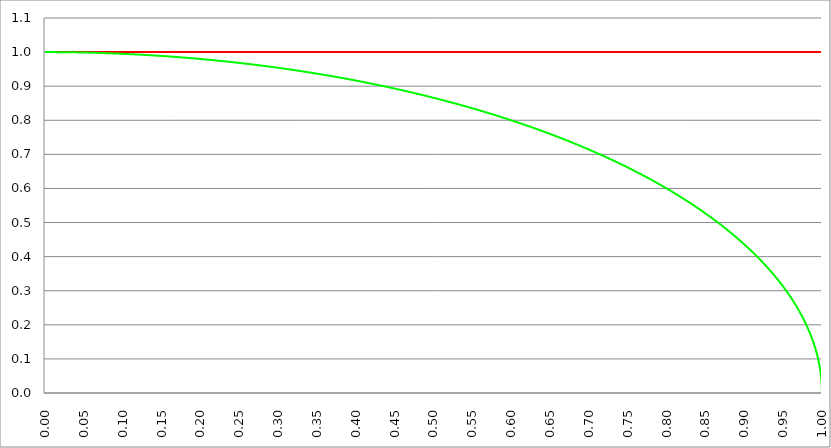
| Category | Series 1 | Series 0 | Series 2 |
|---|---|---|---|
| 0.0 | 1 | 1 |  |
| 0.0005 | 1 | 1 |  |
| 0.001 | 1 | 1 |  |
| 0.0015 | 1 | 1 |  |
| 0.002 | 1 | 1 |  |
| 0.0025 | 1 | 1 |  |
| 0.003 | 1 | 1 |  |
| 0.0035 | 1 | 1 |  |
| 0.004 | 1 | 1 |  |
| 0.0045 | 1 | 1 |  |
| 0.005 | 1 | 1 |  |
| 0.0055 | 1 | 1 |  |
| 0.006 | 1 | 1 |  |
| 0.0065 | 1 | 1 |  |
| 0.007 | 1 | 1 |  |
| 0.0075 | 1 | 1 |  |
| 0.008 | 1 | 1 |  |
| 0.0085 | 1 | 1 |  |
| 0.009 | 1 | 1 |  |
| 0.0095 | 1 | 1 |  |
| 0.01 | 1 | 1 |  |
| 0.0105 | 1 | 1 |  |
| 0.011 | 1 | 1 |  |
| 0.0115 | 1 | 1 |  |
| 0.012 | 1 | 1 |  |
| 0.0125 | 1 | 1 |  |
| 0.013 | 1 | 1 |  |
| 0.0135 | 1 | 1 |  |
| 0.014 | 1 | 1 |  |
| 0.0145 | 1 | 1 |  |
| 0.015 | 1 | 1 |  |
| 0.0155 | 1 | 1 |  |
| 0.016 | 1 | 1 |  |
| 0.0165 | 1 | 1 |  |
| 0.017 | 1 | 1 |  |
| 0.0175 | 1 | 1 |  |
| 0.018 | 1 | 1 |  |
| 0.0185 | 1 | 1 |  |
| 0.019 | 1 | 1 |  |
| 0.0195 | 1 | 1 |  |
| 0.02 | 1 | 1 |  |
| 0.0205 | 1 | 1 |  |
| 0.021 | 1 | 1 |  |
| 0.0215 | 1 | 1 |  |
| 0.022 | 1 | 1 |  |
| 0.0225 | 1 | 1 |  |
| 0.023 | 1 | 1 |  |
| 0.0235 | 1 | 1 |  |
| 0.024 | 1 | 1 |  |
| 0.0245 | 1 | 1 |  |
| 0.025 | 1 | 1 |  |
| 0.0255 | 1 | 1 |  |
| 0.026 | 1 | 1 |  |
| 0.0265 | 1 | 1 |  |
| 0.027 | 1 | 1 |  |
| 0.0275 | 1 | 1 |  |
| 0.028 | 1 | 1 |  |
| 0.0285 | 1 | 1 |  |
| 0.029 | 1 | 1 |  |
| 0.0295 | 1 | 1 |  |
| 0.03 | 1 | 1 |  |
| 0.0305 | 1 | 1 |  |
| 0.031 | 1 | 1 |  |
| 0.0315 | 1 | 1 |  |
| 0.032 | 1 | 0.999 |  |
| 0.0325 | 1 | 0.999 |  |
| 0.033 | 1 | 0.999 |  |
| 0.0335 | 1 | 0.999 |  |
| 0.034 | 1 | 0.999 |  |
| 0.0345 | 1 | 0.999 |  |
| 0.035 | 1 | 0.999 |  |
| 0.0355 | 1 | 0.999 |  |
| 0.036 | 1 | 0.999 |  |
| 0.0365 | 1 | 0.999 |  |
| 0.037 | 1 | 0.999 |  |
| 0.0375 | 1 | 0.999 |  |
| 0.038 | 1 | 0.999 |  |
| 0.0385 | 1 | 0.999 |  |
| 0.039 | 1 | 0.999 |  |
| 0.0395 | 1 | 0.999 |  |
| 0.04 | 1 | 0.999 |  |
| 0.0405 | 1 | 0.999 |  |
| 0.041 | 1 | 0.999 |  |
| 0.0415 | 1 | 0.999 |  |
| 0.042 | 1 | 0.999 |  |
| 0.0425 | 1 | 0.999 |  |
| 0.043 | 1 | 0.999 |  |
| 0.0435 | 1 | 0.999 |  |
| 0.044 | 1 | 0.999 |  |
| 0.0445 | 1 | 0.999 |  |
| 0.045 | 1 | 0.999 |  |
| 0.0455 | 1 | 0.999 |  |
| 0.046 | 1 | 0.999 |  |
| 0.0465 | 1 | 0.999 |  |
| 0.047 | 1 | 0.999 |  |
| 0.0475 | 1 | 0.999 |  |
| 0.048 | 1 | 0.999 |  |
| 0.0485 | 1 | 0.999 |  |
| 0.049 | 1 | 0.999 |  |
| 0.0495 | 1 | 0.999 |  |
| 0.05 | 1 | 0.999 |  |
| 0.0505 | 1 | 0.999 |  |
| 0.051 | 1 | 0.999 |  |
| 0.0515 | 1 | 0.999 |  |
| 0.052 | 1 | 0.999 |  |
| 0.0525 | 1 | 0.999 |  |
| 0.053 | 1 | 0.999 |  |
| 0.0535 | 1 | 0.999 |  |
| 0.054 | 1 | 0.999 |  |
| 0.0545 | 1 | 0.999 |  |
| 0.055 | 1 | 0.998 |  |
| 0.0555 | 1 | 0.998 |  |
| 0.056 | 1 | 0.998 |  |
| 0.0565 | 1 | 0.998 |  |
| 0.057 | 1 | 0.998 |  |
| 0.0575 | 1 | 0.998 |  |
| 0.058 | 1 | 0.998 |  |
| 0.0585 | 1 | 0.998 |  |
| 0.059 | 1 | 0.998 |  |
| 0.0595 | 1 | 0.998 |  |
| 0.06 | 1 | 0.998 |  |
| 0.0605 | 1 | 0.998 |  |
| 0.061 | 1 | 0.998 |  |
| 0.0615 | 1 | 0.998 |  |
| 0.062 | 1 | 0.998 |  |
| 0.0625 | 1 | 0.998 |  |
| 0.063 | 1 | 0.998 |  |
| 0.0635 | 1 | 0.998 |  |
| 0.064 | 1 | 0.998 |  |
| 0.0645 | 1 | 0.998 |  |
| 0.065 | 1 | 0.998 |  |
| 0.0655 | 1 | 0.998 |  |
| 0.066 | 1 | 0.998 |  |
| 0.0665 | 1 | 0.998 |  |
| 0.067 | 1 | 0.998 |  |
| 0.0675 | 1 | 0.998 |  |
| 0.068 | 1 | 0.998 |  |
| 0.0685 | 1 | 0.998 |  |
| 0.069 | 1 | 0.998 |  |
| 0.0695 | 1 | 0.998 |  |
| 0.07 | 1 | 0.998 |  |
| 0.0705 | 1 | 0.998 |  |
| 0.071 | 1 | 0.997 |  |
| 0.0715 | 1 | 0.997 |  |
| 0.072 | 1 | 0.997 |  |
| 0.0725 | 1 | 0.997 |  |
| 0.073 | 1 | 0.997 |  |
| 0.0735 | 1 | 0.997 |  |
| 0.074 | 1 | 0.997 |  |
| 0.0745 | 1 | 0.997 |  |
| 0.075 | 1 | 0.997 |  |
| 0.0755 | 1 | 0.997 |  |
| 0.076 | 1 | 0.997 |  |
| 0.0765 | 1 | 0.997 |  |
| 0.077 | 1 | 0.997 |  |
| 0.0775 | 1 | 0.997 |  |
| 0.078 | 1 | 0.997 |  |
| 0.0785 | 1 | 0.997 |  |
| 0.079 | 1 | 0.997 |  |
| 0.0795 | 1 | 0.997 |  |
| 0.08 | 1 | 0.997 |  |
| 0.0805 | 1 | 0.997 |  |
| 0.081 | 1 | 0.997 |  |
| 0.0815 | 1 | 0.997 |  |
| 0.082 | 1 | 0.997 |  |
| 0.0825 | 1 | 0.997 |  |
| 0.083 | 1 | 0.997 |  |
| 0.0835 | 1 | 0.997 |  |
| 0.084 | 1 | 0.996 |  |
| 0.0845 | 1 | 0.996 |  |
| 0.085 | 1 | 0.996 |  |
| 0.0855 | 1 | 0.996 |  |
| 0.086 | 1 | 0.996 |  |
| 0.0865 | 1 | 0.996 |  |
| 0.087 | 1 | 0.996 |  |
| 0.0875 | 1 | 0.996 |  |
| 0.088 | 1 | 0.996 |  |
| 0.0885 | 1 | 0.996 |  |
| 0.089 | 1 | 0.996 |  |
| 0.0895 | 1 | 0.996 |  |
| 0.09 | 1 | 0.996 |  |
| 0.0905 | 1 | 0.996 |  |
| 0.091 | 1 | 0.996 |  |
| 0.0915 | 1 | 0.996 |  |
| 0.092 | 1 | 0.996 |  |
| 0.0925 | 1 | 0.996 |  |
| 0.093 | 1 | 0.996 |  |
| 0.0935 | 1 | 0.996 |  |
| 0.094 | 1 | 0.996 |  |
| 0.0945 | 1 | 0.996 |  |
| 0.095 | 1 | 0.995 |  |
| 0.0955 | 1 | 0.995 |  |
| 0.096 | 1 | 0.995 |  |
| 0.0965 | 1 | 0.995 |  |
| 0.097 | 1 | 0.995 |  |
| 0.0975 | 1 | 0.995 |  |
| 0.098 | 1 | 0.995 |  |
| 0.0985 | 1 | 0.995 |  |
| 0.099 | 1 | 0.995 |  |
| 0.0995 | 1 | 0.995 |  |
| 0.1 | 1 | 0.995 |  |
| 0.1005 | 1 | 0.995 |  |
| 0.101 | 1 | 0.995 |  |
| 0.1015 | 1 | 0.995 |  |
| 0.102 | 1 | 0.995 |  |
| 0.1025 | 1 | 0.995 |  |
| 0.103 | 1 | 0.995 |  |
| 0.1035 | 1 | 0.995 |  |
| 0.104 | 1 | 0.995 |  |
| 0.1045 | 1 | 0.995 |  |
| 0.105 | 1 | 0.994 |  |
| 0.1055 | 1 | 0.994 |  |
| 0.106 | 1 | 0.994 |  |
| 0.1065 | 1 | 0.994 |  |
| 0.107 | 1 | 0.994 |  |
| 0.1075 | 1 | 0.994 |  |
| 0.108 | 1 | 0.994 |  |
| 0.1085 | 1 | 0.994 |  |
| 0.109 | 1 | 0.994 |  |
| 0.1095 | 1 | 0.994 |  |
| 0.11 | 1 | 0.994 |  |
| 0.1105 | 1 | 0.994 |  |
| 0.111 | 1 | 0.994 |  |
| 0.1115 | 1 | 0.994 |  |
| 0.112 | 1 | 0.994 |  |
| 0.1125 | 1 | 0.994 |  |
| 0.113 | 1 | 0.994 |  |
| 0.1135 | 1 | 0.994 |  |
| 0.114 | 1 | 0.993 |  |
| 0.1145 | 1 | 0.993 |  |
| 0.115 | 1 | 0.993 |  |
| 0.1155 | 1 | 0.993 |  |
| 0.116 | 1 | 0.993 |  |
| 0.1165 | 1 | 0.993 |  |
| 0.117 | 1 | 0.993 |  |
| 0.1175 | 1 | 0.993 |  |
| 0.118 | 1 | 0.993 |  |
| 0.1185 | 1 | 0.993 |  |
| 0.119 | 1 | 0.993 |  |
| 0.1195 | 1 | 0.993 |  |
| 0.12 | 1 | 0.993 |  |
| 0.1205 | 1 | 0.993 |  |
| 0.121 | 1 | 0.993 |  |
| 0.1215 | 1 | 0.993 |  |
| 0.122 | 1 | 0.993 |  |
| 0.1225 | 1 | 0.992 |  |
| 0.123 | 1 | 0.992 |  |
| 0.1235 | 1 | 0.992 |  |
| 0.124 | 1 | 0.992 |  |
| 0.1245 | 1 | 0.992 |  |
| 0.125 | 1 | 0.992 |  |
| 0.1255 | 1 | 0.992 |  |
| 0.126 | 1 | 0.992 |  |
| 0.1265 | 1 | 0.992 |  |
| 0.127 | 1 | 0.992 |  |
| 0.1275 | 1 | 0.992 |  |
| 0.128 | 1 | 0.992 |  |
| 0.1285 | 1 | 0.992 |  |
| 0.129 | 1 | 0.992 |  |
| 0.1295 | 1 | 0.992 |  |
| 0.13 | 1 | 0.992 |  |
| 0.1305 | 1 | 0.991 |  |
| 0.131 | 1 | 0.991 |  |
| 0.1315 | 1 | 0.991 |  |
| 0.132 | 1 | 0.991 |  |
| 0.1325 | 1 | 0.991 |  |
| 0.133 | 1 | 0.991 |  |
| 0.1335 | 1 | 0.991 |  |
| 0.134 | 1 | 0.991 |  |
| 0.1345 | 1 | 0.991 |  |
| 0.135 | 1 | 0.991 |  |
| 0.1355 | 1 | 0.991 |  |
| 0.136 | 1 | 0.991 |  |
| 0.1365 | 1 | 0.991 |  |
| 0.137 | 1 | 0.991 |  |
| 0.1375 | 1 | 0.991 |  |
| 0.138 | 1 | 0.99 |  |
| 0.1385 | 1 | 0.99 |  |
| 0.139 | 1 | 0.99 |  |
| 0.1395 | 1 | 0.99 |  |
| 0.14 | 1 | 0.99 |  |
| 0.1405 | 1 | 0.99 |  |
| 0.141 | 1 | 0.99 |  |
| 0.1415 | 1 | 0.99 |  |
| 0.142 | 1 | 0.99 |  |
| 0.1425 | 1 | 0.99 |  |
| 0.143 | 1 | 0.99 |  |
| 0.1435 | 1 | 0.99 |  |
| 0.144 | 1 | 0.99 |  |
| 0.1445 | 1 | 0.99 |  |
| 0.145 | 1 | 0.989 |  |
| 0.1455 | 1 | 0.989 |  |
| 0.146 | 1 | 0.989 |  |
| 0.1465 | 1 | 0.989 |  |
| 0.147 | 1 | 0.989 |  |
| 0.1475 | 1 | 0.989 |  |
| 0.148 | 1 | 0.989 |  |
| 0.1485 | 1 | 0.989 |  |
| 0.149 | 1 | 0.989 |  |
| 0.1495 | 1 | 0.989 |  |
| 0.15 | 1 | 0.989 |  |
| 0.1505 | 1 | 0.989 |  |
| 0.151 | 1 | 0.989 |  |
| 0.1515 | 1 | 0.988 |  |
| 0.152 | 1 | 0.988 |  |
| 0.1525 | 1 | 0.988 |  |
| 0.153 | 1 | 0.988 |  |
| 0.1535 | 1 | 0.988 |  |
| 0.154 | 1 | 0.988 |  |
| 0.1545 | 1 | 0.988 |  |
| 0.155 | 1 | 0.988 |  |
| 0.1555 | 1 | 0.988 |  |
| 0.156 | 1 | 0.988 |  |
| 0.1565 | 1 | 0.988 |  |
| 0.157 | 1 | 0.988 |  |
| 0.1575 | 1 | 0.988 |  |
| 0.158 | 1 | 0.987 |  |
| 0.1585 | 1 | 0.987 |  |
| 0.159 | 1 | 0.987 |  |
| 0.1595 | 1 | 0.987 |  |
| 0.16 | 1 | 0.987 |  |
| 0.1605 | 1 | 0.987 |  |
| 0.161 | 1 | 0.987 |  |
| 0.1615 | 1 | 0.987 |  |
| 0.162 | 1 | 0.987 |  |
| 0.1625 | 1 | 0.987 |  |
| 0.163 | 1 | 0.987 |  |
| 0.1635 | 1 | 0.987 |  |
| 0.164 | 1 | 0.986 |  |
| 0.1645 | 1 | 0.986 |  |
| 0.165 | 1 | 0.986 |  |
| 0.1655 | 1 | 0.986 |  |
| 0.166 | 1 | 0.986 |  |
| 0.1665 | 1 | 0.986 |  |
| 0.167 | 1 | 0.986 |  |
| 0.1675 | 1 | 0.986 |  |
| 0.168 | 1 | 0.986 |  |
| 0.1685 | 1 | 0.986 |  |
| 0.169 | 1 | 0.986 |  |
| 0.1695 | 1 | 0.986 |  |
| 0.17 | 1 | 0.985 |  |
| 0.1705 | 1 | 0.985 |  |
| 0.171 | 1 | 0.985 |  |
| 0.1715 | 1 | 0.985 |  |
| 0.172 | 1 | 0.985 |  |
| 0.1725 | 1 | 0.985 |  |
| 0.173 | 1 | 0.985 |  |
| 0.1735 | 1 | 0.985 |  |
| 0.174 | 1 | 0.985 |  |
| 0.1745 | 1 | 0.985 |  |
| 0.175 | 1 | 0.985 |  |
| 0.1755 | 1 | 0.984 |  |
| 0.176 | 1 | 0.984 |  |
| 0.1765 | 1 | 0.984 |  |
| 0.177 | 1 | 0.984 |  |
| 0.1775 | 1 | 0.984 |  |
| 0.178 | 1 | 0.984 |  |
| 0.1785 | 1 | 0.984 |  |
| 0.179 | 1 | 0.984 |  |
| 0.1795 | 1 | 0.984 |  |
| 0.18 | 1 | 0.984 |  |
| 0.1805 | 1 | 0.984 |  |
| 0.181 | 1 | 0.983 |  |
| 0.1815 | 1 | 0.983 |  |
| 0.182 | 1 | 0.983 |  |
| 0.1825 | 1 | 0.983 |  |
| 0.183 | 1 | 0.983 |  |
| 0.1835 | 1 | 0.983 |  |
| 0.184 | 1 | 0.983 |  |
| 0.1845 | 1 | 0.983 |  |
| 0.185 | 1 | 0.983 |  |
| 0.1855 | 1 | 0.983 |  |
| 0.186 | 1 | 0.983 |  |
| 0.1865 | 1 | 0.982 |  |
| 0.187 | 1 | 0.982 |  |
| 0.1875 | 1 | 0.982 |  |
| 0.188 | 1 | 0.982 |  |
| 0.1885 | 1 | 0.982 |  |
| 0.189 | 1 | 0.982 |  |
| 0.1895 | 1 | 0.982 |  |
| 0.19 | 1 | 0.982 |  |
| 0.1905 | 1 | 0.982 |  |
| 0.191 | 1 | 0.982 |  |
| 0.1915 | 1 | 0.981 |  |
| 0.192 | 1 | 0.981 |  |
| 0.1925 | 1 | 0.981 |  |
| 0.193 | 1 | 0.981 |  |
| 0.1935 | 1 | 0.981 |  |
| 0.194 | 1 | 0.981 |  |
| 0.1945 | 1 | 0.981 |  |
| 0.195 | 1 | 0.981 |  |
| 0.1955 | 1 | 0.981 |  |
| 0.196 | 1 | 0.981 |  |
| 0.1965 | 1 | 0.981 |  |
| 0.197 | 1 | 0.98 |  |
| 0.1975 | 1 | 0.98 |  |
| 0.198 | 1 | 0.98 |  |
| 0.1985 | 1 | 0.98 |  |
| 0.199 | 1 | 0.98 |  |
| 0.1995 | 1 | 0.98 |  |
| 0.2 | 1 | 0.98 |  |
| 0.2005 | 1 | 0.98 |  |
| 0.201 | 1 | 0.98 |  |
| 0.2015 | 1 | 0.979 |  |
| 0.202 | 1 | 0.979 |  |
| 0.2025 | 1 | 0.979 |  |
| 0.203 | 1 | 0.979 |  |
| 0.2035 | 1 | 0.979 |  |
| 0.204 | 1 | 0.979 |  |
| 0.2045 | 1 | 0.979 |  |
| 0.205 | 1 | 0.979 |  |
| 0.2055 | 1 | 0.979 |  |
| 0.206 | 1 | 0.979 |  |
| 0.2065 | 1 | 0.978 |  |
| 0.207 | 1 | 0.978 |  |
| 0.2075 | 1 | 0.978 |  |
| 0.208 | 1 | 0.978 |  |
| 0.2085 | 1 | 0.978 |  |
| 0.209 | 1 | 0.978 |  |
| 0.2095 | 1 | 0.978 |  |
| 0.21 | 1 | 0.978 |  |
| 0.2105 | 1 | 0.978 |  |
| 0.211 | 1 | 0.977 |  |
| 0.2115 | 1 | 0.977 |  |
| 0.212 | 1 | 0.977 |  |
| 0.2125 | 1 | 0.977 |  |
| 0.213 | 1 | 0.977 |  |
| 0.2135 | 1 | 0.977 |  |
| 0.214 | 1 | 0.977 |  |
| 0.2145 | 1 | 0.977 |  |
| 0.215 | 1 | 0.977 |  |
| 0.2155 | 1 | 0.977 |  |
| 0.216 | 1 | 0.976 |  |
| 0.2165 | 1 | 0.976 |  |
| 0.217 | 1 | 0.976 |  |
| 0.2175 | 1 | 0.976 |  |
| 0.218 | 1 | 0.976 |  |
| 0.2185 | 1 | 0.976 |  |
| 0.219 | 1 | 0.976 |  |
| 0.2195 | 1 | 0.976 |  |
| 0.22 | 1 | 0.975 |  |
| 0.2205 | 1 | 0.975 |  |
| 0.221 | 1 | 0.975 |  |
| 0.2215 | 1 | 0.975 |  |
| 0.222 | 1 | 0.975 |  |
| 0.2225 | 1 | 0.975 |  |
| 0.223 | 1 | 0.975 |  |
| 0.2235 | 1 | 0.975 |  |
| 0.224 | 1 | 0.975 |  |
| 0.2245 | 1 | 0.974 |  |
| 0.225 | 1 | 0.974 |  |
| 0.2255 | 1 | 0.974 |  |
| 0.226 | 1 | 0.974 |  |
| 0.2265 | 1 | 0.974 |  |
| 0.227 | 1 | 0.974 |  |
| 0.2275 | 1 | 0.974 |  |
| 0.228 | 1 | 0.974 |  |
| 0.2285 | 1 | 0.974 |  |
| 0.229 | 1 | 0.973 |  |
| 0.2295 | 1 | 0.973 |  |
| 0.23 | 1 | 0.973 |  |
| 0.2305 | 1 | 0.973 |  |
| 0.231 | 1 | 0.973 |  |
| 0.2315 | 1 | 0.973 |  |
| 0.232 | 1 | 0.973 |  |
| 0.2325 | 1 | 0.973 |  |
| 0.233 | 1 | 0.972 |  |
| 0.2335 | 1 | 0.972 |  |
| 0.234 | 1 | 0.972 |  |
| 0.2345 | 1 | 0.972 |  |
| 0.235 | 1 | 0.972 |  |
| 0.2355 | 1 | 0.972 |  |
| 0.236 | 1 | 0.972 |  |
| 0.2365 | 1 | 0.972 |  |
| 0.237 | 1 | 0.972 |  |
| 0.2375 | 1 | 0.971 |  |
| 0.238 | 1 | 0.971 |  |
| 0.2385 | 1 | 0.971 |  |
| 0.239 | 1 | 0.971 |  |
| 0.2395 | 1 | 0.971 |  |
| 0.24 | 1 | 0.971 |  |
| 0.2405 | 1 | 0.971 |  |
| 0.241 | 1 | 0.971 |  |
| 0.2415 | 1 | 0.97 |  |
| 0.242 | 1 | 0.97 |  |
| 0.2425 | 1 | 0.97 |  |
| 0.243 | 1 | 0.97 |  |
| 0.2435 | 1 | 0.97 |  |
| 0.244 | 1 | 0.97 |  |
| 0.2445 | 1 | 0.97 |  |
| 0.245 | 1 | 0.97 |  |
| 0.2455 | 1 | 0.969 |  |
| 0.246 | 1 | 0.969 |  |
| 0.2465 | 1 | 0.969 |  |
| 0.247 | 1 | 0.969 |  |
| 0.2475 | 1 | 0.969 |  |
| 0.248 | 1 | 0.969 |  |
| 0.2485 | 1 | 0.969 |  |
| 0.249 | 1 | 0.969 |  |
| 0.2495 | 1 | 0.968 |  |
| 0.25 | 1 | 0.968 |  |
| 0.2505 | 1 | 0.968 |  |
| 0.251 | 1 | 0.968 |  |
| 0.2515 | 1 | 0.968 |  |
| 0.252 | 1 | 0.968 |  |
| 0.2525 | 1 | 0.968 |  |
| 0.253 | 1 | 0.967 |  |
| 0.2535 | 1 | 0.967 |  |
| 0.254 | 1 | 0.967 |  |
| 0.2545 | 1 | 0.967 |  |
| 0.255 | 1 | 0.967 |  |
| 0.2555 | 1 | 0.967 |  |
| 0.256 | 1 | 0.967 |  |
| 0.2565 | 1 | 0.967 |  |
| 0.257 | 1 | 0.966 |  |
| 0.2575 | 1 | 0.966 |  |
| 0.258 | 1 | 0.966 |  |
| 0.2585 | 1 | 0.966 |  |
| 0.259 | 1 | 0.966 |  |
| 0.2595 | 1 | 0.966 |  |
| 0.26 | 1 | 0.966 |  |
| 0.2605 | 1 | 0.965 |  |
| 0.261 | 1 | 0.965 |  |
| 0.2615 | 1 | 0.965 |  |
| 0.262 | 1 | 0.965 |  |
| 0.2625 | 1 | 0.965 |  |
| 0.263 | 1 | 0.965 |  |
| 0.2635 | 1 | 0.965 |  |
| 0.264 | 1 | 0.965 |  |
| 0.2645 | 1 | 0.964 |  |
| 0.265 | 1 | 0.964 |  |
| 0.2655 | 1 | 0.964 |  |
| 0.266 | 1 | 0.964 |  |
| 0.2665 | 1 | 0.964 |  |
| 0.267 | 1 | 0.964 |  |
| 0.2675 | 1 | 0.964 |  |
| 0.268 | 1 | 0.963 |  |
| 0.2685 | 1 | 0.963 |  |
| 0.269 | 1 | 0.963 |  |
| 0.2695 | 1 | 0.963 |  |
| 0.27 | 1 | 0.963 |  |
| 0.2705 | 1 | 0.963 |  |
| 0.271 | 1 | 0.963 |  |
| 0.2715 | 1 | 0.962 |  |
| 0.272 | 1 | 0.962 |  |
| 0.2725 | 1 | 0.962 |  |
| 0.273 | 1 | 0.962 |  |
| 0.2735 | 1 | 0.962 |  |
| 0.274 | 1 | 0.962 |  |
| 0.2745 | 1 | 0.962 |  |
| 0.275 | 1 | 0.961 |  |
| 0.2755 | 1 | 0.961 |  |
| 0.276 | 1 | 0.961 |  |
| 0.2765 | 1 | 0.961 |  |
| 0.277 | 1 | 0.961 |  |
| 0.2775 | 1 | 0.961 |  |
| 0.278 | 1 | 0.961 |  |
| 0.2785 | 1 | 0.96 |  |
| 0.279 | 1 | 0.96 |  |
| 0.2795 | 1 | 0.96 |  |
| 0.28 | 1 | 0.96 |  |
| 0.2805 | 1 | 0.96 |  |
| 0.281 | 1 | 0.96 |  |
| 0.2815 | 1 | 0.96 |  |
| 0.282 | 1 | 0.959 |  |
| 0.2825 | 1 | 0.959 |  |
| 0.283 | 1 | 0.959 |  |
| 0.2835 | 1 | 0.959 |  |
| 0.284 | 1 | 0.959 |  |
| 0.2845 | 1 | 0.959 |  |
| 0.285 | 1 | 0.959 |  |
| 0.2855 | 1 | 0.958 |  |
| 0.286 | 1 | 0.958 |  |
| 0.2865 | 1 | 0.958 |  |
| 0.287 | 1 | 0.958 |  |
| 0.2875 | 1 | 0.958 |  |
| 0.288 | 1 | 0.958 |  |
| 0.2885 | 1 | 0.957 |  |
| 0.289 | 1 | 0.957 |  |
| 0.2895 | 1 | 0.957 |  |
| 0.29 | 1 | 0.957 |  |
| 0.2905 | 1 | 0.957 |  |
| 0.291 | 1 | 0.957 |  |
| 0.2915 | 1 | 0.957 |  |
| 0.292 | 1 | 0.956 |  |
| 0.2925 | 1 | 0.956 |  |
| 0.293 | 1 | 0.956 |  |
| 0.2935 | 1 | 0.956 |  |
| 0.294 | 1 | 0.956 |  |
| 0.2945 | 1 | 0.956 |  |
| 0.295 | 1 | 0.955 |  |
| 0.2955 | 1 | 0.955 |  |
| 0.296 | 1 | 0.955 |  |
| 0.2965 | 1 | 0.955 |  |
| 0.297 | 1 | 0.955 |  |
| 0.2975 | 1 | 0.955 |  |
| 0.298 | 1 | 0.955 |  |
| 0.2985 | 1 | 0.954 |  |
| 0.299 | 1 | 0.954 |  |
| 0.2995 | 1 | 0.954 |  |
| 0.3 | 1 | 0.954 |  |
| 0.3005 | 1 | 0.954 |  |
| 0.301 | 1 | 0.954 |  |
| 0.3015 | 1 | 0.953 |  |
| 0.302 | 1 | 0.953 |  |
| 0.3025 | 1 | 0.953 |  |
| 0.303 | 1 | 0.953 |  |
| 0.3035 | 1 | 0.953 |  |
| 0.304 | 1 | 0.953 |  |
| 0.3045 | 1 | 0.953 |  |
| 0.305 | 1 | 0.952 |  |
| 0.3055 | 1 | 0.952 |  |
| 0.306 | 1 | 0.952 |  |
| 0.3065 | 1 | 0.952 |  |
| 0.307 | 1 | 0.952 |  |
| 0.3075 | 1 | 0.952 |  |
| 0.308 | 1 | 0.951 |  |
| 0.3085 | 1 | 0.951 |  |
| 0.309 | 1 | 0.951 |  |
| 0.3095 | 1 | 0.951 |  |
| 0.31 | 1 | 0.951 |  |
| 0.3105 | 1 | 0.951 |  |
| 0.311 | 1 | 0.95 |  |
| 0.3115 | 1 | 0.95 |  |
| 0.312 | 1 | 0.95 |  |
| 0.3125 | 1 | 0.95 |  |
| 0.313 | 1 | 0.95 |  |
| 0.3135 | 1 | 0.95 |  |
| 0.314 | 1 | 0.949 |  |
| 0.3145 | 1 | 0.949 |  |
| 0.315 | 1 | 0.949 |  |
| 0.3155 | 1 | 0.949 |  |
| 0.316 | 1 | 0.949 |  |
| 0.3165 | 1 | 0.949 |  |
| 0.317 | 1 | 0.948 |  |
| 0.3175 | 1 | 0.948 |  |
| 0.318 | 1 | 0.948 |  |
| 0.3185 | 1 | 0.948 |  |
| 0.319 | 1 | 0.948 |  |
| 0.3195 | 1 | 0.948 |  |
| 0.32 | 1 | 0.947 |  |
| 0.3205 | 1 | 0.947 |  |
| 0.321 | 1 | 0.947 |  |
| 0.3215 | 1 | 0.947 |  |
| 0.322 | 1 | 0.947 |  |
| 0.3225 | 1 | 0.947 |  |
| 0.323 | 1 | 0.946 |  |
| 0.3235 | 1 | 0.946 |  |
| 0.324 | 1 | 0.946 |  |
| 0.3245 | 1 | 0.946 |  |
| 0.325 | 1 | 0.946 |  |
| 0.3255 | 1 | 0.946 |  |
| 0.326 | 1 | 0.945 |  |
| 0.3265 | 1 | 0.945 |  |
| 0.327 | 1 | 0.945 |  |
| 0.3275 | 1 | 0.945 |  |
| 0.328 | 1 | 0.945 |  |
| 0.3285 | 1 | 0.945 |  |
| 0.329 | 1 | 0.944 |  |
| 0.3295 | 1 | 0.944 |  |
| 0.33 | 1 | 0.944 |  |
| 0.3305 | 1 | 0.944 |  |
| 0.331 | 1 | 0.944 |  |
| 0.3315 | 1 | 0.943 |  |
| 0.332 | 1 | 0.943 |  |
| 0.3325 | 1 | 0.943 |  |
| 0.333 | 1 | 0.943 |  |
| 0.3335 | 1 | 0.943 |  |
| 0.334 | 1 | 0.943 |  |
| 0.3345 | 1 | 0.942 |  |
| 0.335 | 1 | 0.942 |  |
| 0.3355 | 1 | 0.942 |  |
| 0.336 | 1 | 0.942 |  |
| 0.3365 | 1 | 0.942 |  |
| 0.337 | 1 | 0.942 |  |
| 0.3375 | 1 | 0.941 |  |
| 0.338 | 1 | 0.941 |  |
| 0.3385 | 1 | 0.941 |  |
| 0.339 | 1 | 0.941 |  |
| 0.3395 | 1 | 0.941 |  |
| 0.34 | 1 | 0.94 |  |
| 0.3405 | 1 | 0.94 |  |
| 0.341 | 1 | 0.94 |  |
| 0.3415 | 1 | 0.94 |  |
| 0.342 | 1 | 0.94 |  |
| 0.3425 | 1 | 0.94 |  |
| 0.343 | 1 | 0.939 |  |
| 0.3435 | 1 | 0.939 |  |
| 0.344 | 1 | 0.939 |  |
| 0.3445 | 1 | 0.939 |  |
| 0.345 | 1 | 0.939 |  |
| 0.3455 | 1 | 0.938 |  |
| 0.346 | 1 | 0.938 |  |
| 0.3465 | 1 | 0.938 |  |
| 0.347 | 1 | 0.938 |  |
| 0.3475 | 1 | 0.938 |  |
| 0.348 | 1 | 0.937 |  |
| 0.3485 | 1 | 0.937 |  |
| 0.349 | 1 | 0.937 |  |
| 0.3495 | 1 | 0.937 |  |
| 0.35 | 1 | 0.937 |  |
| 0.3505 | 1 | 0.937 |  |
| 0.351 | 1 | 0.936 |  |
| 0.3515 | 1 | 0.936 |  |
| 0.352 | 1 | 0.936 |  |
| 0.3525 | 1 | 0.936 |  |
| 0.353 | 1 | 0.936 |  |
| 0.3535 | 1 | 0.935 |  |
| 0.354 | 1 | 0.935 |  |
| 0.3545 | 1 | 0.935 |  |
| 0.355 | 1 | 0.935 |  |
| 0.3555 | 1 | 0.935 |  |
| 0.356 | 1 | 0.934 |  |
| 0.3565 | 1 | 0.934 |  |
| 0.357 | 1 | 0.934 |  |
| 0.3575 | 1 | 0.934 |  |
| 0.358 | 1 | 0.934 |  |
| 0.3585 | 1 | 0.934 |  |
| 0.359 | 1 | 0.933 |  |
| 0.3595 | 1 | 0.933 |  |
| 0.36 | 1 | 0.933 |  |
| 0.3605 | 1 | 0.933 |  |
| 0.361 | 1 | 0.933 |  |
| 0.3615 | 1 | 0.932 |  |
| 0.362 | 1 | 0.932 |  |
| 0.3625 | 1 | 0.932 |  |
| 0.363 | 1 | 0.932 |  |
| 0.3635 | 1 | 0.932 |  |
| 0.364 | 1 | 0.931 |  |
| 0.3645 | 1 | 0.931 |  |
| 0.365 | 1 | 0.931 |  |
| 0.3655 | 1 | 0.931 |  |
| 0.366 | 1 | 0.931 |  |
| 0.3665 | 1 | 0.93 |  |
| 0.367 | 1 | 0.93 |  |
| 0.3675 | 1 | 0.93 |  |
| 0.368 | 1 | 0.93 |  |
| 0.3685 | 1 | 0.93 |  |
| 0.369 | 1 | 0.929 |  |
| 0.3695 | 1 | 0.929 |  |
| 0.37 | 1 | 0.929 |  |
| 0.3705 | 1 | 0.929 |  |
| 0.371 | 1 | 0.929 |  |
| 0.3715 | 1 | 0.928 |  |
| 0.372 | 1 | 0.928 |  |
| 0.3725 | 1 | 0.928 |  |
| 0.373 | 1 | 0.928 |  |
| 0.3735 | 1 | 0.928 |  |
| 0.374 | 1 | 0.927 |  |
| 0.3745 | 1 | 0.927 |  |
| 0.375 | 1 | 0.927 |  |
| 0.3755 | 1 | 0.927 |  |
| 0.376 | 1 | 0.927 |  |
| 0.3765 | 1 | 0.926 |  |
| 0.377 | 1 | 0.926 |  |
| 0.3775 | 1 | 0.926 |  |
| 0.378 | 1 | 0.926 |  |
| 0.3785 | 1 | 0.926 |  |
| 0.379 | 1 | 0.925 |  |
| 0.3795 | 1 | 0.925 |  |
| 0.38 | 1 | 0.925 |  |
| 0.3805 | 1 | 0.925 |  |
| 0.381 | 1 | 0.925 |  |
| 0.3815 | 1 | 0.924 |  |
| 0.382 | 1 | 0.924 |  |
| 0.3825 | 1 | 0.924 |  |
| 0.383 | 1 | 0.924 |  |
| 0.3835 | 1 | 0.924 |  |
| 0.384 | 1 | 0.923 |  |
| 0.3845 | 1 | 0.923 |  |
| 0.385 | 1 | 0.923 |  |
| 0.3855 | 1 | 0.923 |  |
| 0.386 | 1 | 0.922 |  |
| 0.3865 | 1 | 0.922 |  |
| 0.387 | 1 | 0.922 |  |
| 0.3875 | 1 | 0.922 |  |
| 0.388 | 1 | 0.922 |  |
| 0.3885 | 1 | 0.921 |  |
| 0.389 | 1 | 0.921 |  |
| 0.3895 | 1 | 0.921 |  |
| 0.39 | 1 | 0.921 |  |
| 0.3905 | 1 | 0.921 |  |
| 0.391 | 1 | 0.92 |  |
| 0.3915 | 1 | 0.92 |  |
| 0.392 | 1 | 0.92 |  |
| 0.3925 | 1 | 0.92 |  |
| 0.393 | 1 | 0.92 |  |
| 0.3935 | 1 | 0.919 |  |
| 0.394 | 1 | 0.919 |  |
| 0.3945 | 1 | 0.919 |  |
| 0.395 | 1 | 0.919 |  |
| 0.3955 | 1 | 0.918 |  |
| 0.396 | 1 | 0.918 |  |
| 0.3965 | 1 | 0.918 |  |
| 0.397 | 1 | 0.918 |  |
| 0.3975 | 1 | 0.918 |  |
| 0.398 | 1 | 0.917 |  |
| 0.3985 | 1 | 0.917 |  |
| 0.399 | 1 | 0.917 |  |
| 0.3995 | 1 | 0.917 |  |
| 0.4 | 1 | 0.917 |  |
| 0.4005 | 1 | 0.916 |  |
| 0.401 | 1 | 0.916 |  |
| 0.4015 | 1 | 0.916 |  |
| 0.402 | 1 | 0.916 |  |
| 0.4025 | 1 | 0.915 |  |
| 0.403 | 1 | 0.915 |  |
| 0.4035 | 1 | 0.915 |  |
| 0.404 | 1 | 0.915 |  |
| 0.4045 | 1 | 0.915 |  |
| 0.405 | 1 | 0.914 |  |
| 0.4055 | 1 | 0.914 |  |
| 0.406 | 1 | 0.914 |  |
| 0.4065 | 1 | 0.914 |  |
| 0.407 | 1 | 0.913 |  |
| 0.4075 | 1 | 0.913 |  |
| 0.408 | 1 | 0.913 |  |
| 0.4085 | 1 | 0.913 |  |
| 0.409 | 1 | 0.913 |  |
| 0.4095 | 1 | 0.912 |  |
| 0.41 | 1 | 0.912 |  |
| 0.4105 | 1 | 0.912 |  |
| 0.411 | 1 | 0.912 |  |
| 0.4115 | 1 | 0.911 |  |
| 0.412 | 1 | 0.911 |  |
| 0.4125 | 1 | 0.911 |  |
| 0.413 | 1 | 0.911 |  |
| 0.4135 | 1 | 0.911 |  |
| 0.414 | 1 | 0.91 |  |
| 0.4145 | 1 | 0.91 |  |
| 0.415 | 1 | 0.91 |  |
| 0.4155 | 1 | 0.91 |  |
| 0.416 | 1 | 0.909 |  |
| 0.4165 | 1 | 0.909 |  |
| 0.417 | 1 | 0.909 |  |
| 0.4175 | 1 | 0.909 |  |
| 0.418 | 1 | 0.908 |  |
| 0.4185 | 1 | 0.908 |  |
| 0.419 | 1 | 0.908 |  |
| 0.4195 | 1 | 0.908 |  |
| 0.42 | 1 | 0.908 |  |
| 0.4205 | 1 | 0.907 |  |
| 0.421 | 1 | 0.907 |  |
| 0.4215 | 1 | 0.907 |  |
| 0.422 | 1 | 0.907 |  |
| 0.4225 | 1 | 0.906 |  |
| 0.423 | 1 | 0.906 |  |
| 0.4235 | 1 | 0.906 |  |
| 0.424 | 1 | 0.906 |  |
| 0.4245 | 1 | 0.905 |  |
| 0.425 | 1 | 0.905 |  |
| 0.4255 | 1 | 0.905 |  |
| 0.426 | 1 | 0.905 |  |
| 0.4265 | 1 | 0.904 |  |
| 0.427 | 1 | 0.904 |  |
| 0.4275 | 1 | 0.904 |  |
| 0.428 | 1 | 0.904 |  |
| 0.4285 | 1 | 0.904 |  |
| 0.429 | 1 | 0.903 |  |
| 0.4295 | 1 | 0.903 |  |
| 0.43 | 1 | 0.903 |  |
| 0.4305 | 1 | 0.903 |  |
| 0.431 | 1 | 0.902 |  |
| 0.4315 | 1 | 0.902 |  |
| 0.432 | 1 | 0.902 |  |
| 0.4325 | 1 | 0.902 |  |
| 0.433 | 1 | 0.901 |  |
| 0.4335 | 1 | 0.901 |  |
| 0.434 | 1 | 0.901 |  |
| 0.4345 | 1 | 0.901 |  |
| 0.435 | 1 | 0.9 |  |
| 0.4355 | 1 | 0.9 |  |
| 0.436 | 1 | 0.9 |  |
| 0.4365 | 1 | 0.9 |  |
| 0.437 | 1 | 0.899 |  |
| 0.4375 | 1 | 0.899 |  |
| 0.438 | 1 | 0.899 |  |
| 0.4385 | 1 | 0.899 |  |
| 0.439 | 1 | 0.898 |  |
| 0.4395 | 1 | 0.898 |  |
| 0.44 | 1 | 0.898 |  |
| 0.4405 | 1 | 0.898 |  |
| 0.441 | 1 | 0.898 |  |
| 0.4415 | 1 | 0.897 |  |
| 0.442 | 1 | 0.897 |  |
| 0.4425 | 1 | 0.897 |  |
| 0.443 | 1 | 0.897 |  |
| 0.4435 | 1 | 0.896 |  |
| 0.444 | 1 | 0.896 |  |
| 0.4445 | 1 | 0.896 |  |
| 0.445 | 1 | 0.896 |  |
| 0.4455 | 1 | 0.895 |  |
| 0.446 | 1 | 0.895 |  |
| 0.4465 | 1 | 0.895 |  |
| 0.447 | 1 | 0.895 |  |
| 0.4475 | 1 | 0.894 |  |
| 0.448 | 1 | 0.894 |  |
| 0.4485 | 1 | 0.894 |  |
| 0.449 | 1 | 0.894 |  |
| 0.4495 | 1 | 0.893 |  |
| 0.45 | 1 | 0.893 |  |
| 0.4505 | 1 | 0.893 |  |
| 0.451 | 1 | 0.893 |  |
| 0.4515 | 1 | 0.892 |  |
| 0.452 | 1 | 0.892 |  |
| 0.4525 | 1 | 0.892 |  |
| 0.453 | 1 | 0.892 |  |
| 0.4535 | 1 | 0.891 |  |
| 0.454 | 1 | 0.891 |  |
| 0.4545 | 1 | 0.891 |  |
| 0.455 | 1 | 0.89 |  |
| 0.4555 | 1 | 0.89 |  |
| 0.456 | 1 | 0.89 |  |
| 0.4565 | 1 | 0.89 |  |
| 0.457 | 1 | 0.889 |  |
| 0.4575 | 1 | 0.889 |  |
| 0.458 | 1 | 0.889 |  |
| 0.4585 | 1 | 0.889 |  |
| 0.459 | 1 | 0.888 |  |
| 0.4595 | 1 | 0.888 |  |
| 0.46 | 1 | 0.888 |  |
| 0.4605 | 1 | 0.888 |  |
| 0.461 | 1 | 0.887 |  |
| 0.4615 | 1 | 0.887 |  |
| 0.462 | 1 | 0.887 |  |
| 0.4625 | 1 | 0.887 |  |
| 0.463 | 1 | 0.886 |  |
| 0.4635 | 1 | 0.886 |  |
| 0.464 | 1 | 0.886 |  |
| 0.4645 | 1 | 0.886 |  |
| 0.465 | 1 | 0.885 |  |
| 0.4655 | 1 | 0.885 |  |
| 0.466 | 1 | 0.885 |  |
| 0.4665 | 1 | 0.885 |  |
| 0.467 | 1 | 0.884 |  |
| 0.4675 | 1 | 0.884 |  |
| 0.468 | 1 | 0.884 |  |
| 0.4685 | 1 | 0.883 |  |
| 0.469 | 1 | 0.883 |  |
| 0.4695 | 1 | 0.883 |  |
| 0.47 | 1 | 0.883 |  |
| 0.4705 | 1 | 0.882 |  |
| 0.471 | 1 | 0.882 |  |
| 0.4715 | 1 | 0.882 |  |
| 0.472 | 1 | 0.882 |  |
| 0.4725 | 1 | 0.881 |  |
| 0.473 | 1 | 0.881 |  |
| 0.4735 | 1 | 0.881 |  |
| 0.474 | 1 | 0.881 |  |
| 0.4745 | 1 | 0.88 |  |
| 0.475 | 1 | 0.88 |  |
| 0.4755 | 1 | 0.88 |  |
| 0.476 | 1 | 0.879 |  |
| 0.4765 | 1 | 0.879 |  |
| 0.477 | 1 | 0.879 |  |
| 0.4775 | 1 | 0.879 |  |
| 0.478 | 1 | 0.878 |  |
| 0.4785 | 1 | 0.878 |  |
| 0.479 | 1 | 0.878 |  |
| 0.4795 | 1 | 0.878 |  |
| 0.48 | 1 | 0.877 |  |
| 0.4805 | 1 | 0.877 |  |
| 0.481 | 1 | 0.877 |  |
| 0.4815 | 1 | 0.876 |  |
| 0.482 | 1 | 0.876 |  |
| 0.4825 | 1 | 0.876 |  |
| 0.483 | 1 | 0.876 |  |
| 0.4835 | 1 | 0.875 |  |
| 0.484 | 1 | 0.875 |  |
| 0.4845 | 1 | 0.875 |  |
| 0.485 | 1 | 0.875 |  |
| 0.4855 | 1 | 0.874 |  |
| 0.486 | 1 | 0.874 |  |
| 0.4865 | 1 | 0.874 |  |
| 0.487 | 1 | 0.873 |  |
| 0.4875 | 1 | 0.873 |  |
| 0.488 | 1 | 0.873 |  |
| 0.4885 | 1 | 0.873 |  |
| 0.489 | 1 | 0.872 |  |
| 0.4895 | 1 | 0.872 |  |
| 0.49 | 1 | 0.872 |  |
| 0.4905 | 1 | 0.871 |  |
| 0.491 | 1 | 0.871 |  |
| 0.4915 | 1 | 0.871 |  |
| 0.492 | 1 | 0.871 |  |
| 0.4925 | 1 | 0.87 |  |
| 0.493 | 1 | 0.87 |  |
| 0.4935 | 1 | 0.87 |  |
| 0.494 | 1 | 0.869 |  |
| 0.4945 | 1 | 0.869 |  |
| 0.495 | 1 | 0.869 |  |
| 0.4955 | 1 | 0.869 |  |
| 0.496 | 1 | 0.868 |  |
| 0.4965 | 1 | 0.868 |  |
| 0.497 | 1 | 0.868 |  |
| 0.4975 | 1 | 0.867 |  |
| 0.498 | 1 | 0.867 |  |
| 0.4985 | 1 | 0.867 |  |
| 0.499 | 1 | 0.867 |  |
| 0.4995 | 1 | 0.866 |  |
| 0.5 | 1 | 0.866 |  |
| 0.5005 | 1 | 0.866 |  |
| 0.501 | 1 | 0.865 |  |
| 0.5015 | 1 | 0.865 |  |
| 0.502 | 1 | 0.865 |  |
| 0.5025 | 1 | 0.865 |  |
| 0.503 | 1 | 0.864 |  |
| 0.5035 | 1 | 0.864 |  |
| 0.504 | 1 | 0.864 |  |
| 0.5045 | 1 | 0.863 |  |
| 0.505 | 1 | 0.863 |  |
| 0.5055 | 1 | 0.863 |  |
| 0.506 | 1 | 0.863 |  |
| 0.5065 | 1 | 0.862 |  |
| 0.507 | 1 | 0.862 |  |
| 0.5075 | 1 | 0.862 |  |
| 0.507999999999999 | 1 | 0.861 |  |
| 0.508499999999999 | 1 | 0.861 |  |
| 0.508999999999999 | 1 | 0.861 |  |
| 0.509499999999999 | 1 | 0.86 |  |
| 0.509999999999999 | 1 | 0.86 |  |
| 0.510499999999999 | 1 | 0.86 |  |
| 0.510999999999999 | 1 | 0.86 |  |
| 0.511499999999999 | 1 | 0.859 |  |
| 0.511999999999999 | 1 | 0.859 |  |
| 0.512499999999999 | 1 | 0.859 |  |
| 0.512999999999999 | 1 | 0.858 |  |
| 0.513499999999999 | 1 | 0.858 |  |
| 0.513999999999999 | 1 | 0.858 |  |
| 0.514499999999999 | 1 | 0.857 |  |
| 0.514999999999999 | 1 | 0.857 |  |
| 0.515499999999999 | 1 | 0.857 |  |
| 0.515999999999999 | 1 | 0.857 |  |
| 0.516499999999999 | 1 | 0.856 |  |
| 0.516999999999998 | 1 | 0.856 |  |
| 0.517499999999998 | 1 | 0.856 |  |
| 0.517999999999998 | 1 | 0.855 |  |
| 0.518499999999998 | 1 | 0.855 |  |
| 0.518999999999998 | 1 | 0.855 |  |
| 0.519499999999998 | 1 | 0.854 |  |
| 0.519999999999998 | 1 | 0.854 |  |
| 0.520499999999998 | 1 | 0.854 |  |
| 0.520999999999998 | 1 | 0.854 |  |
| 0.521499999999998 | 1 | 0.853 |  |
| 0.521999999999998 | 1 | 0.853 |  |
| 0.522499999999998 | 1 | 0.853 |  |
| 0.522999999999998 | 1 | 0.852 |  |
| 0.523499999999998 | 1 | 0.852 |  |
| 0.523999999999998 | 1 | 0.852 |  |
| 0.524499999999998 | 1 | 0.851 |  |
| 0.524999999999998 | 1 | 0.851 |  |
| 0.525499999999998 | 1 | 0.851 |  |
| 0.525999999999997 | 1 | 0.85 |  |
| 0.526499999999997 | 1 | 0.85 |  |
| 0.526999999999997 | 1 | 0.85 |  |
| 0.527499999999997 | 1 | 0.85 |  |
| 0.527999999999997 | 1 | 0.849 |  |
| 0.528499999999997 | 1 | 0.849 |  |
| 0.528999999999997 | 1 | 0.849 |  |
| 0.529499999999997 | 1 | 0.848 |  |
| 0.529999999999997 | 1 | 0.848 |  |
| 0.530499999999997 | 1 | 0.848 |  |
| 0.530999999999997 | 1 | 0.847 |  |
| 0.531499999999997 | 1 | 0.847 |  |
| 0.531999999999997 | 1 | 0.847 |  |
| 0.532499999999997 | 1 | 0.846 |  |
| 0.532999999999997 | 1 | 0.846 |  |
| 0.533499999999997 | 1 | 0.846 |  |
| 0.533999999999997 | 1 | 0.845 |  |
| 0.534499999999997 | 1 | 0.845 |  |
| 0.534999999999996 | 1 | 0.845 |  |
| 0.535499999999996 | 1 | 0.845 |  |
| 0.535999999999996 | 1 | 0.844 |  |
| 0.536499999999996 | 1 | 0.844 |  |
| 0.536999999999996 | 1 | 0.844 |  |
| 0.537499999999996 | 1 | 0.843 |  |
| 0.537999999999996 | 1 | 0.843 |  |
| 0.538499999999996 | 1 | 0.843 |  |
| 0.538999999999996 | 1 | 0.842 |  |
| 0.539499999999996 | 1 | 0.842 |  |
| 0.539999999999996 | 1 | 0.842 |  |
| 0.540499999999996 | 1 | 0.841 |  |
| 0.540999999999996 | 1 | 0.841 |  |
| 0.541499999999996 | 1 | 0.841 |  |
| 0.541999999999996 | 1 | 0.84 |  |
| 0.542499999999996 | 1 | 0.84 |  |
| 0.542999999999996 | 1 | 0.84 |  |
| 0.543499999999996 | 1 | 0.839 |  |
| 0.543999999999995 | 1 | 0.839 |  |
| 0.544499999999995 | 1 | 0.839 |  |
| 0.544999999999995 | 1 | 0.838 |  |
| 0.545499999999995 | 1 | 0.838 |  |
| 0.545999999999995 | 1 | 0.838 |  |
| 0.546499999999995 | 1 | 0.837 |  |
| 0.546999999999995 | 1 | 0.837 |  |
| 0.547499999999995 | 1 | 0.837 |  |
| 0.547999999999995 | 1 | 0.836 |  |
| 0.548499999999995 | 1 | 0.836 |  |
| 0.548999999999995 | 1 | 0.836 |  |
| 0.549499999999995 | 1 | 0.835 |  |
| 0.549999999999995 | 1 | 0.835 |  |
| 0.550499999999995 | 1 | 0.835 |  |
| 0.550999999999995 | 1 | 0.835 |  |
| 0.551499999999995 | 1 | 0.834 |  |
| 0.551999999999995 | 1 | 0.834 |  |
| 0.552499999999995 | 1 | 0.834 |  |
| 0.552999999999994 | 1 | 0.833 |  |
| 0.553499999999994 | 1 | 0.833 |  |
| 0.553999999999994 | 1 | 0.833 |  |
| 0.554499999999994 | 1 | 0.832 |  |
| 0.554999999999994 | 1 | 0.832 |  |
| 0.555499999999994 | 1 | 0.832 |  |
| 0.555999999999994 | 1 | 0.831 |  |
| 0.556499999999994 | 1 | 0.831 |  |
| 0.556999999999994 | 1 | 0.831 |  |
| 0.557499999999994 | 1 | 0.83 |  |
| 0.557999999999994 | 1 | 0.83 |  |
| 0.558499999999994 | 1 | 0.83 |  |
| 0.558999999999994 | 1 | 0.829 |  |
| 0.559499999999994 | 1 | 0.829 |  |
| 0.559999999999994 | 1 | 0.828 |  |
| 0.560499999999994 | 1 | 0.828 |  |
| 0.560999999999994 | 1 | 0.828 |  |
| 0.561499999999994 | 1 | 0.827 |  |
| 0.561999999999993 | 1 | 0.827 |  |
| 0.562499999999993 | 1 | 0.827 |  |
| 0.562999999999993 | 1 | 0.826 |  |
| 0.563499999999993 | 1 | 0.826 |  |
| 0.563999999999993 | 1 | 0.826 |  |
| 0.564499999999993 | 1 | 0.825 |  |
| 0.564999999999993 | 1 | 0.825 |  |
| 0.565499999999993 | 1 | 0.825 |  |
| 0.565999999999993 | 1 | 0.824 |  |
| 0.566499999999993 | 1 | 0.824 |  |
| 0.566999999999993 | 1 | 0.824 |  |
| 0.567499999999993 | 1 | 0.823 |  |
| 0.567999999999993 | 1 | 0.823 |  |
| 0.568499999999993 | 1 | 0.823 |  |
| 0.568999999999993 | 1 | 0.822 |  |
| 0.569499999999993 | 1 | 0.822 |  |
| 0.569999999999993 | 1 | 0.822 |  |
| 0.570499999999993 | 1 | 0.821 |  |
| 0.570999999999993 | 1 | 0.821 |  |
| 0.571499999999992 | 1 | 0.821 |  |
| 0.571999999999992 | 1 | 0.82 |  |
| 0.572499999999992 | 1 | 0.82 |  |
| 0.572999999999992 | 1 | 0.82 |  |
| 0.573499999999992 | 1 | 0.819 |  |
| 0.573999999999992 | 1 | 0.819 |  |
| 0.574499999999992 | 1 | 0.819 |  |
| 0.574999999999992 | 1 | 0.818 |  |
| 0.575499999999992 | 1 | 0.818 |  |
| 0.575999999999992 | 1 | 0.817 |  |
| 0.576499999999992 | 1 | 0.817 |  |
| 0.576999999999992 | 1 | 0.817 |  |
| 0.577499999999992 | 1 | 0.816 |  |
| 0.577999999999992 | 1 | 0.816 |  |
| 0.578499999999992 | 1 | 0.816 |  |
| 0.578999999999992 | 1 | 0.815 |  |
| 0.579499999999992 | 1 | 0.815 |  |
| 0.579999999999992 | 1 | 0.815 |  |
| 0.580499999999991 | 1 | 0.814 |  |
| 0.580999999999991 | 1 | 0.814 |  |
| 0.581499999999991 | 1 | 0.814 |  |
| 0.581999999999991 | 1 | 0.813 |  |
| 0.582499999999991 | 1 | 0.813 |  |
| 0.582999999999991 | 1 | 0.812 |  |
| 0.583499999999991 | 1 | 0.812 |  |
| 0.583999999999991 | 1 | 0.812 |  |
| 0.584499999999991 | 1 | 0.811 |  |
| 0.584999999999991 | 1 | 0.811 |  |
| 0.585499999999991 | 1 | 0.811 |  |
| 0.585999999999991 | 1 | 0.81 |  |
| 0.586499999999991 | 1 | 0.81 |  |
| 0.586999999999991 | 1 | 0.81 |  |
| 0.587499999999991 | 1 | 0.809 |  |
| 0.587999999999991 | 1 | 0.809 |  |
| 0.588499999999991 | 1 | 0.808 |  |
| 0.588999999999991 | 1 | 0.808 |  |
| 0.58949999999999 | 1 | 0.808 |  |
| 0.58999999999999 | 1 | 0.807 |  |
| 0.59049999999999 | 1 | 0.807 |  |
| 0.59099999999999 | 1 | 0.807 |  |
| 0.59149999999999 | 1 | 0.806 |  |
| 0.59199999999999 | 1 | 0.806 |  |
| 0.59249999999999 | 1 | 0.806 |  |
| 0.59299999999999 | 1 | 0.805 |  |
| 0.59349999999999 | 1 | 0.805 |  |
| 0.59399999999999 | 1 | 0.804 |  |
| 0.59449999999999 | 1 | 0.804 |  |
| 0.59499999999999 | 1 | 0.804 |  |
| 0.59549999999999 | 1 | 0.803 |  |
| 0.59599999999999 | 1 | 0.803 |  |
| 0.59649999999999 | 1 | 0.803 |  |
| 0.59699999999999 | 1 | 0.802 |  |
| 0.59749999999999 | 1 | 0.802 |  |
| 0.59799999999999 | 1 | 0.801 |  |
| 0.598499999999989 | 1 | 0.801 |  |
| 0.598999999999989 | 1 | 0.801 |  |
| 0.599499999999989 | 1 | 0.8 |  |
| 0.599999999999989 | 1 | 0.8 |  |
| 0.600499999999989 | 1 | 0.8 |  |
| 0.600999999999989 | 1 | 0.799 |  |
| 0.601499999999989 | 1 | 0.799 |  |
| 0.601999999999989 | 1 | 0.798 |  |
| 0.602499999999989 | 1 | 0.798 |  |
| 0.602999999999989 | 1 | 0.798 |  |
| 0.603499999999989 | 1 | 0.797 |  |
| 0.603999999999989 | 1 | 0.797 |  |
| 0.604499999999989 | 1 | 0.797 |  |
| 0.604999999999989 | 1 | 0.796 |  |
| 0.605499999999989 | 1 | 0.796 |  |
| 0.605999999999989 | 1 | 0.795 |  |
| 0.606499999999989 | 1 | 0.795 |  |
| 0.606999999999988 | 1 | 0.795 |  |
| 0.607499999999988 | 1 | 0.794 |  |
| 0.607999999999988 | 1 | 0.794 |  |
| 0.608499999999988 | 1 | 0.794 |  |
| 0.608999999999988 | 1 | 0.793 |  |
| 0.609499999999988 | 1 | 0.793 |  |
| 0.609999999999988 | 1 | 0.792 |  |
| 0.610499999999988 | 1 | 0.792 |  |
| 0.610999999999988 | 1 | 0.792 |  |
| 0.611499999999988 | 1 | 0.791 |  |
| 0.611999999999988 | 1 | 0.791 |  |
| 0.612499999999988 | 1 | 0.79 |  |
| 0.612999999999988 | 1 | 0.79 |  |
| 0.613499999999988 | 1 | 0.79 |  |
| 0.613999999999988 | 1 | 0.789 |  |
| 0.614499999999988 | 1 | 0.789 |  |
| 0.614999999999988 | 1 | 0.789 |  |
| 0.615499999999988 | 1 | 0.788 |  |
| 0.615999999999987 | 1 | 0.788 |  |
| 0.616499999999987 | 1 | 0.787 |  |
| 0.616999999999987 | 1 | 0.787 |  |
| 0.617499999999987 | 1 | 0.787 |  |
| 0.617999999999987 | 1 | 0.786 |  |
| 0.618499999999987 | 1 | 0.786 |  |
| 0.618999999999987 | 1 | 0.785 |  |
| 0.619499999999987 | 1 | 0.785 |  |
| 0.619999999999987 | 1 | 0.785 |  |
| 0.620499999999987 | 1 | 0.784 |  |
| 0.620999999999987 | 1 | 0.784 |  |
| 0.621499999999987 | 1 | 0.783 |  |
| 0.621999999999987 | 1 | 0.783 |  |
| 0.622499999999987 | 1 | 0.783 |  |
| 0.622999999999987 | 1 | 0.782 |  |
| 0.623499999999987 | 1 | 0.782 |  |
| 0.623999999999987 | 1 | 0.781 |  |
| 0.624499999999987 | 1 | 0.781 |  |
| 0.624999999999986 | 1 | 0.781 |  |
| 0.625499999999986 | 1 | 0.78 |  |
| 0.625999999999986 | 1 | 0.78 |  |
| 0.626499999999986 | 1 | 0.779 |  |
| 0.626999999999986 | 1 | 0.779 |  |
| 0.627499999999986 | 1 | 0.779 |  |
| 0.627999999999986 | 1 | 0.778 |  |
| 0.628499999999986 | 1 | 0.778 |  |
| 0.628999999999986 | 1 | 0.777 |  |
| 0.629499999999986 | 1 | 0.777 |  |
| 0.629999999999986 | 1 | 0.777 |  |
| 0.630499999999986 | 1 | 0.776 |  |
| 0.630999999999986 | 1 | 0.776 |  |
| 0.631499999999986 | 1 | 0.775 |  |
| 0.631999999999986 | 1 | 0.775 |  |
| 0.632499999999986 | 1 | 0.775 |  |
| 0.632999999999986 | 1 | 0.774 |  |
| 0.633499999999986 | 1 | 0.774 |  |
| 0.633999999999985 | 1 | 0.773 |  |
| 0.634499999999985 | 1 | 0.773 |  |
| 0.634999999999985 | 1 | 0.773 |  |
| 0.635499999999985 | 1 | 0.772 |  |
| 0.635999999999985 | 1 | 0.772 |  |
| 0.636499999999985 | 1 | 0.771 |  |
| 0.636999999999985 | 1 | 0.771 |  |
| 0.637499999999985 | 1 | 0.77 |  |
| 0.637999999999985 | 1 | 0.77 |  |
| 0.638499999999985 | 1 | 0.77 |  |
| 0.638999999999985 | 1 | 0.769 |  |
| 0.639499999999985 | 1 | 0.769 |  |
| 0.639999999999985 | 1 | 0.768 |  |
| 0.640499999999985 | 1 | 0.768 |  |
| 0.640999999999985 | 1 | 0.768 |  |
| 0.641499999999985 | 1 | 0.767 |  |
| 0.641999999999985 | 1 | 0.767 |  |
| 0.642499999999985 | 1 | 0.766 |  |
| 0.642999999999984 | 1 | 0.766 |  |
| 0.643499999999984 | 1 | 0.765 |  |
| 0.643999999999984 | 1 | 0.765 |  |
| 0.644499999999984 | 1 | 0.765 |  |
| 0.644999999999984 | 1 | 0.764 |  |
| 0.645499999999984 | 1 | 0.764 |  |
| 0.645999999999984 | 1 | 0.763 |  |
| 0.646499999999984 | 1 | 0.763 |  |
| 0.646999999999984 | 1 | 0.762 |  |
| 0.647499999999984 | 1 | 0.762 |  |
| 0.647999999999984 | 1 | 0.762 |  |
| 0.648499999999984 | 1 | 0.761 |  |
| 0.648999999999984 | 1 | 0.761 |  |
| 0.649499999999984 | 1 | 0.76 |  |
| 0.649999999999984 | 1 | 0.76 |  |
| 0.650499999999984 | 1 | 0.76 |  |
| 0.650999999999984 | 1 | 0.759 |  |
| 0.651499999999984 | 1 | 0.759 |  |
| 0.651999999999983 | 1 | 0.758 |  |
| 0.652499999999983 | 1 | 0.758 |  |
| 0.652999999999983 | 1 | 0.757 |  |
| 0.653499999999983 | 1 | 0.757 |  |
| 0.653999999999983 | 1 | 0.756 |  |
| 0.654499999999983 | 1 | 0.756 |  |
| 0.654999999999983 | 1 | 0.756 |  |
| 0.655499999999983 | 1 | 0.755 |  |
| 0.655999999999983 | 1 | 0.755 |  |
| 0.656499999999983 | 1 | 0.754 |  |
| 0.656999999999983 | 1 | 0.754 |  |
| 0.657499999999983 | 1 | 0.753 |  |
| 0.657999999999983 | 1 | 0.753 |  |
| 0.658499999999983 | 1 | 0.753 |  |
| 0.658999999999983 | 1 | 0.752 |  |
| 0.659499999999983 | 1 | 0.752 |  |
| 0.659999999999983 | 1 | 0.751 |  |
| 0.660499999999983 | 1 | 0.751 |  |
| 0.660999999999983 | 1 | 0.75 |  |
| 0.661499999999982 | 1 | 0.75 |  |
| 0.661999999999982 | 1 | 0.75 |  |
| 0.662499999999982 | 1 | 0.749 |  |
| 0.662999999999982 | 1 | 0.749 |  |
| 0.663499999999982 | 1 | 0.748 |  |
| 0.663999999999982 | 1 | 0.748 |  |
| 0.664499999999982 | 1 | 0.747 |  |
| 0.664999999999982 | 1 | 0.747 |  |
| 0.665499999999982 | 1 | 0.746 |  |
| 0.665999999999982 | 1 | 0.746 |  |
| 0.666499999999982 | 1 | 0.746 |  |
| 0.666999999999982 | 1 | 0.745 |  |
| 0.667499999999982 | 1 | 0.745 |  |
| 0.667999999999982 | 1 | 0.744 |  |
| 0.668499999999982 | 1 | 0.744 |  |
| 0.668999999999982 | 1 | 0.743 |  |
| 0.669499999999982 | 1 | 0.743 |  |
| 0.669999999999982 | 1 | 0.742 |  |
| 0.670499999999981 | 1 | 0.742 |  |
| 0.670999999999981 | 1 | 0.741 |  |
| 0.671499999999981 | 1 | 0.741 |  |
| 0.671999999999981 | 1 | 0.741 |  |
| 0.672499999999981 | 1 | 0.74 |  |
| 0.672999999999981 | 1 | 0.74 |  |
| 0.673499999999981 | 1 | 0.739 |  |
| 0.673999999999981 | 1 | 0.739 |  |
| 0.674499999999981 | 1 | 0.738 |  |
| 0.674999999999981 | 1 | 0.738 |  |
| 0.675499999999981 | 1 | 0.737 |  |
| 0.675999999999981 | 1 | 0.737 |  |
| 0.676499999999981 | 1 | 0.736 |  |
| 0.676999999999981 | 1 | 0.736 |  |
| 0.677499999999981 | 1 | 0.736 |  |
| 0.677999999999981 | 1 | 0.735 |  |
| 0.678499999999981 | 1 | 0.735 |  |
| 0.678999999999981 | 1 | 0.734 |  |
| 0.67949999999998 | 1 | 0.734 |  |
| 0.67999999999998 | 1 | 0.733 |  |
| 0.68049999999998 | 1 | 0.733 |  |
| 0.68099999999998 | 1 | 0.732 |  |
| 0.68149999999998 | 1 | 0.732 |  |
| 0.68199999999998 | 1 | 0.731 |  |
| 0.68249999999998 | 1 | 0.731 |  |
| 0.68299999999998 | 1 | 0.73 |  |
| 0.68349999999998 | 1 | 0.73 |  |
| 0.68399999999998 | 1 | 0.729 |  |
| 0.68449999999998 | 1 | 0.729 |  |
| 0.68499999999998 | 1 | 0.729 |  |
| 0.68549999999998 | 1 | 0.728 |  |
| 0.68599999999998 | 1 | 0.728 |  |
| 0.68649999999998 | 1 | 0.727 |  |
| 0.68699999999998 | 1 | 0.727 |  |
| 0.68749999999998 | 1 | 0.726 |  |
| 0.68799999999998 | 1 | 0.726 |  |
| 0.688499999999979 | 1 | 0.725 |  |
| 0.688999999999979 | 1 | 0.725 |  |
| 0.689499999999979 | 1 | 0.724 |  |
| 0.689999999999979 | 1 | 0.724 |  |
| 0.690499999999979 | 1 | 0.723 |  |
| 0.690999999999979 | 1 | 0.723 |  |
| 0.691499999999979 | 1 | 0.722 |  |
| 0.691999999999979 | 1 | 0.722 |  |
| 0.692499999999979 | 1 | 0.721 |  |
| 0.692999999999979 | 1 | 0.721 |  |
| 0.693499999999979 | 1 | 0.72 |  |
| 0.693999999999979 | 1 | 0.72 |  |
| 0.694499999999979 | 1 | 0.719 |  |
| 0.694999999999979 | 1 | 0.719 |  |
| 0.695499999999979 | 1 | 0.719 |  |
| 0.695999999999979 | 1 | 0.718 |  |
| 0.696499999999979 | 1 | 0.718 |  |
| 0.696999999999979 | 1 | 0.717 |  |
| 0.697499999999978 | 1 | 0.717 |  |
| 0.697999999999978 | 1 | 0.716 |  |
| 0.698499999999978 | 1 | 0.716 |  |
| 0.698999999999978 | 1 | 0.715 |  |
| 0.699499999999978 | 1 | 0.715 |  |
| 0.699999999999978 | 1 | 0.714 |  |
| 0.700499999999978 | 1 | 0.714 |  |
| 0.700999999999978 | 1 | 0.713 |  |
| 0.701499999999978 | 1 | 0.713 |  |
| 0.701999999999978 | 1 | 0.712 |  |
| 0.702499999999978 | 1 | 0.712 |  |
| 0.702999999999978 | 1 | 0.711 |  |
| 0.703499999999978 | 1 | 0.711 |  |
| 0.703999999999978 | 1 | 0.71 |  |
| 0.704499999999978 | 1 | 0.71 |  |
| 0.704999999999978 | 1 | 0.709 |  |
| 0.705499999999978 | 1 | 0.709 |  |
| 0.705999999999978 | 1 | 0.708 |  |
| 0.706499999999978 | 1 | 0.708 |  |
| 0.706999999999977 | 1 | 0.707 |  |
| 0.707499999999977 | 1 | 0.707 |  |
| 0.707999999999977 | 1 | 0.706 |  |
| 0.708499999999977 | 1 | 0.706 |  |
| 0.708999999999977 | 1 | 0.705 |  |
| 0.709499999999977 | 1 | 0.705 |  |
| 0.709999999999977 | 1 | 0.704 |  |
| 0.710499999999977 | 1 | 0.704 |  |
| 0.710999999999977 | 1 | 0.703 |  |
| 0.711499999999977 | 1 | 0.703 |  |
| 0.711999999999977 | 1 | 0.702 |  |
| 0.712499999999977 | 1 | 0.702 |  |
| 0.712999999999977 | 1 | 0.701 |  |
| 0.713499999999977 | 1 | 0.701 |  |
| 0.713999999999977 | 1 | 0.7 |  |
| 0.714499999999977 | 1 | 0.7 |  |
| 0.714999999999977 | 1 | 0.699 |  |
| 0.715499999999977 | 1 | 0.699 |  |
| 0.715999999999976 | 1 | 0.698 |  |
| 0.716499999999976 | 1 | 0.698 |  |
| 0.716999999999976 | 1 | 0.697 |  |
| 0.717499999999976 | 1 | 0.697 |  |
| 0.717999999999976 | 1 | 0.696 |  |
| 0.718499999999976 | 1 | 0.696 |  |
| 0.718999999999976 | 1 | 0.695 |  |
| 0.719499999999976 | 1 | 0.694 |  |
| 0.719999999999976 | 1 | 0.694 |  |
| 0.720499999999976 | 1 | 0.693 |  |
| 0.720999999999976 | 1 | 0.693 |  |
| 0.721499999999976 | 1 | 0.692 |  |
| 0.721999999999976 | 1 | 0.692 |  |
| 0.722499999999976 | 1 | 0.691 |  |
| 0.722999999999976 | 1 | 0.691 |  |
| 0.723499999999976 | 1 | 0.69 |  |
| 0.723999999999976 | 1 | 0.69 |  |
| 0.724499999999976 | 1 | 0.689 |  |
| 0.724999999999975 | 1 | 0.689 |  |
| 0.725499999999975 | 1 | 0.688 |  |
| 0.725999999999975 | 1 | 0.688 |  |
| 0.726499999999975 | 1 | 0.687 |  |
| 0.726999999999975 | 1 | 0.687 |  |
| 0.727499999999975 | 1 | 0.686 |  |
| 0.727999999999975 | 1 | 0.686 |  |
| 0.728499999999975 | 1 | 0.685 |  |
| 0.728999999999975 | 1 | 0.685 |  |
| 0.729499999999975 | 1 | 0.684 |  |
| 0.729999999999975 | 1 | 0.683 |  |
| 0.730499999999975 | 1 | 0.683 |  |
| 0.730999999999975 | 1 | 0.682 |  |
| 0.731499999999975 | 1 | 0.682 |  |
| 0.731999999999975 | 1 | 0.681 |  |
| 0.732499999999975 | 1 | 0.681 |  |
| 0.732999999999975 | 1 | 0.68 |  |
| 0.733499999999975 | 1 | 0.68 |  |
| 0.733999999999974 | 1 | 0.679 |  |
| 0.734499999999974 | 1 | 0.679 |  |
| 0.734999999999974 | 1 | 0.678 |  |
| 0.735499999999974 | 1 | 0.678 |  |
| 0.735999999999974 | 1 | 0.677 |  |
| 0.736499999999974 | 1 | 0.676 |  |
| 0.736999999999974 | 1 | 0.676 |  |
| 0.737499999999974 | 1 | 0.675 |  |
| 0.737999999999974 | 1 | 0.675 |  |
| 0.738499999999974 | 1 | 0.674 |  |
| 0.738999999999974 | 1 | 0.674 |  |
| 0.739499999999974 | 1 | 0.673 |  |
| 0.739999999999974 | 1 | 0.673 |  |
| 0.740499999999974 | 1 | 0.672 |  |
| 0.740999999999974 | 1 | 0.672 |  |
| 0.741499999999974 | 1 | 0.671 |  |
| 0.741999999999974 | 1 | 0.67 |  |
| 0.742499999999974 | 1 | 0.67 |  |
| 0.742999999999973 | 1 | 0.669 |  |
| 0.743499999999973 | 1 | 0.669 |  |
| 0.743999999999973 | 1 | 0.668 |  |
| 0.744499999999973 | 1 | 0.668 |  |
| 0.744999999999973 | 1 | 0.667 |  |
| 0.745499999999973 | 1 | 0.667 |  |
| 0.745999999999973 | 1 | 0.666 |  |
| 0.746499999999973 | 1 | 0.665 |  |
| 0.746999999999973 | 1 | 0.665 |  |
| 0.747499999999973 | 1 | 0.664 |  |
| 0.747999999999973 | 1 | 0.664 |  |
| 0.748499999999973 | 1 | 0.663 |  |
| 0.748999999999973 | 1 | 0.663 |  |
| 0.749499999999973 | 1 | 0.662 |  |
| 0.749999999999973 | 1 | 0.661 |  |
| 0.750499999999973 | 1 | 0.661 |  |
| 0.750999999999973 | 1 | 0.66 |  |
| 0.751499999999973 | 1 | 0.66 |  |
| 0.751999999999973 | 1 | 0.659 |  |
| 0.752499999999972 | 1 | 0.659 |  |
| 0.752999999999972 | 1 | 0.658 |  |
| 0.753499999999972 | 1 | 0.657 |  |
| 0.753999999999972 | 1 | 0.657 |  |
| 0.754499999999972 | 1 | 0.656 |  |
| 0.754999999999972 | 1 | 0.656 |  |
| 0.755499999999972 | 1 | 0.655 |  |
| 0.755999999999972 | 1 | 0.655 |  |
| 0.756499999999972 | 1 | 0.654 |  |
| 0.756999999999972 | 1 | 0.653 |  |
| 0.757499999999972 | 1 | 0.653 |  |
| 0.757999999999972 | 1 | 0.652 |  |
| 0.758499999999972 | 1 | 0.652 |  |
| 0.758999999999972 | 1 | 0.651 |  |
| 0.759499999999972 | 1 | 0.651 |  |
| 0.759999999999972 | 1 | 0.65 |  |
| 0.760499999999972 | 1 | 0.649 |  |
| 0.760999999999972 | 1 | 0.649 |  |
| 0.761499999999971 | 1 | 0.648 |  |
| 0.761999999999971 | 1 | 0.648 |  |
| 0.762499999999971 | 1 | 0.647 |  |
| 0.762999999999971 | 1 | 0.646 |  |
| 0.763499999999971 | 1 | 0.646 |  |
| 0.763999999999971 | 1 | 0.645 |  |
| 0.764499999999971 | 1 | 0.645 |  |
| 0.764999999999971 | 1 | 0.644 |  |
| 0.765499999999971 | 1 | 0.643 |  |
| 0.765999999999971 | 1 | 0.643 |  |
| 0.766499999999971 | 1 | 0.642 |  |
| 0.766999999999971 | 1 | 0.642 |  |
| 0.767499999999971 | 1 | 0.641 |  |
| 0.767999999999971 | 1 | 0.64 |  |
| 0.768499999999971 | 1 | 0.64 |  |
| 0.768999999999971 | 1 | 0.639 |  |
| 0.769499999999971 | 1 | 0.639 |  |
| 0.769999999999971 | 1 | 0.638 |  |
| 0.77049999999997 | 1 | 0.637 |  |
| 0.77099999999997 | 1 | 0.637 |  |
| 0.77149999999997 | 1 | 0.636 |  |
| 0.77199999999997 | 1 | 0.636 |  |
| 0.77249999999997 | 1 | 0.635 |  |
| 0.77299999999997 | 1 | 0.634 |  |
| 0.77349999999997 | 1 | 0.634 |  |
| 0.77399999999997 | 1 | 0.633 |  |
| 0.77449999999997 | 1 | 0.633 |  |
| 0.77499999999997 | 1 | 0.632 |  |
| 0.77549999999997 | 1 | 0.631 |  |
| 0.77599999999997 | 1 | 0.631 |  |
| 0.77649999999997 | 1 | 0.63 |  |
| 0.77699999999997 | 1 | 0.63 |  |
| 0.77749999999997 | 1 | 0.629 |  |
| 0.77799999999997 | 1 | 0.628 |  |
| 0.77849999999997 | 1 | 0.628 |  |
| 0.77899999999997 | 1 | 0.627 |  |
| 0.779499999999969 | 1 | 0.626 |  |
| 0.779999999999969 | 1 | 0.626 |  |
| 0.780499999999969 | 1 | 0.625 |  |
| 0.780999999999969 | 1 | 0.625 |  |
| 0.781499999999969 | 1 | 0.624 |  |
| 0.781999999999969 | 1 | 0.623 |  |
| 0.782499999999969 | 1 | 0.623 |  |
| 0.782999999999969 | 1 | 0.622 |  |
| 0.783499999999969 | 1 | 0.621 |  |
| 0.783999999999969 | 1 | 0.621 |  |
| 0.784499999999969 | 1 | 0.62 |  |
| 0.784999999999969 | 1 | 0.619 |  |
| 0.785499999999969 | 1 | 0.619 |  |
| 0.785999999999969 | 1 | 0.618 |  |
| 0.786499999999969 | 1 | 0.618 |  |
| 0.786999999999969 | 1 | 0.617 |  |
| 0.787499999999969 | 1 | 0.616 |  |
| 0.787999999999969 | 1 | 0.616 |  |
| 0.788499999999968 | 1 | 0.615 |  |
| 0.788999999999968 | 1 | 0.614 |  |
| 0.789499999999968 | 1 | 0.614 |  |
| 0.789999999999968 | 1 | 0.613 |  |
| 0.790499999999968 | 1 | 0.612 |  |
| 0.790999999999968 | 1 | 0.612 |  |
| 0.791499999999968 | 1 | 0.611 |  |
| 0.791999999999968 | 1 | 0.611 |  |
| 0.792499999999968 | 1 | 0.61 |  |
| 0.792999999999968 | 1 | 0.609 |  |
| 0.793499999999968 | 1 | 0.609 |  |
| 0.793999999999968 | 1 | 0.608 |  |
| 0.794499999999968 | 1 | 0.607 |  |
| 0.794999999999968 | 1 | 0.607 |  |
| 0.795499999999968 | 1 | 0.606 |  |
| 0.795999999999968 | 1 | 0.605 |  |
| 0.796499999999968 | 1 | 0.605 |  |
| 0.796999999999968 | 1 | 0.604 |  |
| 0.797499999999967 | 1 | 0.603 |  |
| 0.797999999999967 | 1 | 0.603 |  |
| 0.798499999999967 | 1 | 0.602 |  |
| 0.798999999999967 | 1 | 0.601 |  |
| 0.799499999999967 | 1 | 0.601 |  |
| 0.799999999999967 | 1 | 0.6 |  |
| 0.800499999999967 | 1 | 0.599 |  |
| 0.800999999999967 | 1 | 0.599 |  |
| 0.801499999999967 | 1 | 0.598 |  |
| 0.801999999999967 | 1 | 0.597 |  |
| 0.802499999999967 | 1 | 0.597 |  |
| 0.802999999999967 | 1 | 0.596 |  |
| 0.803499999999967 | 1 | 0.595 |  |
| 0.803999999999967 | 1 | 0.595 |  |
| 0.804499999999967 | 1 | 0.594 |  |
| 0.804999999999967 | 1 | 0.593 |  |
| 0.805499999999967 | 1 | 0.593 |  |
| 0.805999999999967 | 1 | 0.592 |  |
| 0.806499999999967 | 1 | 0.591 |  |
| 0.806999999999966 | 1 | 0.591 |  |
| 0.807499999999966 | 1 | 0.59 |  |
| 0.807999999999966 | 1 | 0.589 |  |
| 0.808499999999966 | 1 | 0.588 |  |
| 0.808999999999966 | 1 | 0.588 |  |
| 0.809499999999966 | 1 | 0.587 |  |
| 0.809999999999966 | 1 | 0.586 |  |
| 0.810499999999966 | 1 | 0.586 |  |
| 0.810999999999966 | 1 | 0.585 |  |
| 0.811499999999966 | 1 | 0.584 |  |
| 0.811999999999966 | 1 | 0.584 |  |
| 0.812499999999966 | 1 | 0.583 |  |
| 0.812999999999966 | 1 | 0.582 |  |
| 0.813499999999966 | 1 | 0.582 |  |
| 0.813999999999966 | 1 | 0.581 |  |
| 0.814499999999966 | 1 | 0.58 |  |
| 0.814999999999966 | 1 | 0.579 |  |
| 0.815499999999966 | 1 | 0.579 |  |
| 0.815999999999965 | 1 | 0.578 |  |
| 0.816499999999965 | 1 | 0.577 |  |
| 0.816999999999965 | 1 | 0.577 |  |
| 0.817499999999965 | 1 | 0.576 |  |
| 0.817999999999965 | 1 | 0.575 |  |
| 0.818499999999965 | 1 | 0.575 |  |
| 0.818999999999965 | 1 | 0.574 |  |
| 0.819499999999965 | 1 | 0.573 |  |
| 0.819999999999965 | 1 | 0.572 |  |
| 0.820499999999965 | 1 | 0.572 |  |
| 0.820999999999965 | 1 | 0.571 |  |
| 0.821499999999965 | 1 | 0.57 |  |
| 0.821999999999965 | 1 | 0.569 |  |
| 0.822499999999965 | 1 | 0.569 |  |
| 0.822999999999965 | 1 | 0.568 |  |
| 0.823499999999965 | 1 | 0.567 |  |
| 0.823999999999965 | 1 | 0.567 |  |
| 0.824499999999965 | 1 | 0.566 |  |
| 0.824999999999964 | 1 | 0.565 |  |
| 0.825499999999964 | 1 | 0.564 |  |
| 0.825999999999964 | 1 | 0.564 |  |
| 0.826499999999964 | 1 | 0.563 |  |
| 0.826999999999964 | 1 | 0.562 |  |
| 0.827499999999964 | 1 | 0.561 |  |
| 0.827999999999964 | 1 | 0.561 |  |
| 0.828499999999964 | 1 | 0.56 |  |
| 0.828999999999964 | 1 | 0.559 |  |
| 0.829499999999964 | 1 | 0.559 |  |
| 0.829999999999964 | 1 | 0.558 |  |
| 0.830499999999964 | 1 | 0.557 |  |
| 0.830999999999964 | 1 | 0.556 |  |
| 0.831499999999964 | 1 | 0.556 |  |
| 0.831999999999964 | 1 | 0.555 |  |
| 0.832499999999964 | 1 | 0.554 |  |
| 0.832999999999964 | 1 | 0.553 |  |
| 0.833499999999964 | 1 | 0.553 |  |
| 0.833999999999963 | 1 | 0.552 |  |
| 0.834499999999963 | 1 | 0.551 |  |
| 0.834999999999963 | 1 | 0.55 |  |
| 0.835499999999963 | 1 | 0.549 |  |
| 0.835999999999963 | 1 | 0.549 |  |
| 0.836499999999963 | 1 | 0.548 |  |
| 0.836999999999963 | 1 | 0.547 |  |
| 0.837499999999963 | 1 | 0.546 |  |
| 0.837999999999963 | 1 | 0.546 |  |
| 0.838499999999963 | 1 | 0.545 |  |
| 0.838999999999963 | 1 | 0.544 |  |
| 0.839499999999963 | 1 | 0.543 |  |
| 0.839999999999963 | 1 | 0.543 |  |
| 0.840499999999963 | 1 | 0.542 |  |
| 0.840999999999963 | 1 | 0.541 |  |
| 0.841499999999963 | 1 | 0.54 |  |
| 0.841999999999963 | 1 | 0.539 |  |
| 0.842499999999963 | 1 | 0.539 |  |
| 0.842999999999963 | 1 | 0.538 |  |
| 0.843499999999962 | 1 | 0.537 |  |
| 0.843999999999962 | 1 | 0.536 |  |
| 0.844499999999962 | 1 | 0.536 |  |
| 0.844999999999962 | 1 | 0.535 |  |
| 0.845499999999962 | 1 | 0.534 |  |
| 0.845999999999962 | 1 | 0.533 |  |
| 0.846499999999962 | 1 | 0.532 |  |
| 0.846999999999962 | 1 | 0.532 |  |
| 0.847499999999962 | 1 | 0.531 |  |
| 0.847999999999962 | 1 | 0.53 |  |
| 0.848499999999962 | 1 | 0.529 |  |
| 0.848999999999962 | 1 | 0.528 |  |
| 0.849499999999962 | 1 | 0.528 |  |
| 0.849999999999962 | 1 | 0.527 |  |
| 0.850499999999962 | 1 | 0.526 |  |
| 0.850999999999962 | 1 | 0.525 |  |
| 0.851499999999962 | 1 | 0.524 |  |
| 0.851999999999962 | 1 | 0.524 |  |
| 0.852499999999961 | 1 | 0.523 |  |
| 0.852999999999961 | 1 | 0.522 |  |
| 0.853499999999961 | 1 | 0.521 |  |
| 0.853999999999961 | 1 | 0.52 |  |
| 0.854499999999961 | 1 | 0.519 |  |
| 0.854999999999961 | 1 | 0.519 |  |
| 0.855499999999961 | 1 | 0.518 |  |
| 0.855999999999961 | 1 | 0.517 |  |
| 0.856499999999961 | 1 | 0.516 |  |
| 0.856999999999961 | 1 | 0.515 |  |
| 0.857499999999961 | 1 | 0.514 |  |
| 0.857999999999961 | 1 | 0.514 |  |
| 0.858499999999961 | 1 | 0.513 |  |
| 0.858999999999961 | 1 | 0.512 |  |
| 0.859499999999961 | 1 | 0.511 |  |
| 0.859999999999961 | 1 | 0.51 |  |
| 0.860499999999961 | 1 | 0.509 |  |
| 0.860999999999961 | 1 | 0.509 |  |
| 0.86149999999996 | 1 | 0.508 |  |
| 0.86199999999996 | 1 | 0.507 |  |
| 0.86249999999996 | 1 | 0.506 |  |
| 0.86299999999996 | 1 | 0.505 |  |
| 0.86349999999996 | 1 | 0.504 |  |
| 0.86399999999996 | 1 | 0.503 |  |
| 0.86449999999996 | 1 | 0.503 |  |
| 0.86499999999996 | 1 | 0.502 |  |
| 0.86549999999996 | 1 | 0.501 |  |
| 0.86599999999996 | 1 | 0.5 |  |
| 0.86649999999996 | 1 | 0.499 |  |
| 0.86699999999996 | 1 | 0.498 |  |
| 0.86749999999996 | 1 | 0.497 |  |
| 0.86799999999996 | 1 | 0.497 |  |
| 0.86849999999996 | 1 | 0.496 |  |
| 0.86899999999996 | 1 | 0.495 |  |
| 0.86949999999996 | 1 | 0.494 |  |
| 0.86999999999996 | 1 | 0.493 |  |
| 0.870499999999959 | 1 | 0.492 |  |
| 0.870999999999959 | 1 | 0.491 |  |
| 0.871499999999959 | 1 | 0.49 |  |
| 0.871999999999959 | 1 | 0.49 |  |
| 0.872499999999959 | 1 | 0.489 |  |
| 0.872999999999959 | 1 | 0.488 |  |
| 0.873499999999959 | 1 | 0.487 |  |
| 0.873999999999959 | 1 | 0.486 |  |
| 0.874499999999959 | 1 | 0.485 |  |
| 0.874999999999959 | 1 | 0.484 |  |
| 0.875499999999959 | 1 | 0.483 |  |
| 0.875999999999959 | 1 | 0.482 |  |
| 0.876499999999959 | 1 | 0.481 |  |
| 0.876999999999959 | 1 | 0.48 |  |
| 0.877499999999959 | 1 | 0.48 |  |
| 0.877999999999959 | 1 | 0.479 |  |
| 0.878499999999959 | 1 | 0.478 |  |
| 0.878999999999959 | 1 | 0.477 |  |
| 0.879499999999958 | 1 | 0.476 |  |
| 0.879999999999958 | 1 | 0.475 |  |
| 0.880499999999958 | 1 | 0.474 |  |
| 0.880999999999958 | 1 | 0.473 |  |
| 0.881499999999958 | 1 | 0.472 |  |
| 0.881999999999958 | 1 | 0.471 |  |
| 0.882499999999958 | 1 | 0.47 |  |
| 0.882999999999958 | 1 | 0.469 |  |
| 0.883499999999958 | 1 | 0.468 |  |
| 0.883999999999958 | 1 | 0.467 |  |
| 0.884499999999958 | 1 | 0.467 |  |
| 0.884999999999958 | 1 | 0.466 |  |
| 0.885499999999958 | 1 | 0.465 |  |
| 0.885999999999958 | 1 | 0.464 |  |
| 0.886499999999958 | 1 | 0.463 |  |
| 0.886999999999958 | 1 | 0.462 |  |
| 0.887499999999958 | 1 | 0.461 |  |
| 0.887999999999958 | 1 | 0.46 |  |
| 0.888499999999957 | 1 | 0.459 |  |
| 0.888999999999957 | 1 | 0.458 |  |
| 0.889499999999957 | 1 | 0.457 |  |
| 0.889999999999957 | 1 | 0.456 |  |
| 0.890499999999957 | 1 | 0.455 |  |
| 0.890999999999957 | 1 | 0.454 |  |
| 0.891499999999957 | 1 | 0.453 |  |
| 0.891999999999957 | 1 | 0.452 |  |
| 0.892499999999957 | 1 | 0.451 |  |
| 0.892999999999957 | 1 | 0.45 |  |
| 0.893499999999957 | 1 | 0.449 |  |
| 0.893999999999957 | 1 | 0.448 |  |
| 0.894499999999957 | 1 | 0.447 |  |
| 0.894999999999957 | 1 | 0.446 |  |
| 0.895499999999957 | 1 | 0.445 |  |
| 0.895999999999957 | 1 | 0.444 |  |
| 0.896499999999957 | 1 | 0.443 |  |
| 0.896999999999957 | 1 | 0.442 |  |
| 0.897499999999956 | 1 | 0.441 |  |
| 0.897999999999956 | 1 | 0.44 |  |
| 0.898499999999956 | 1 | 0.439 |  |
| 0.898999999999956 | 1 | 0.438 |  |
| 0.899499999999956 | 1 | 0.437 |  |
| 0.899999999999956 | 1 | 0.436 |  |
| 0.900499999999956 | 1 | 0.435 |  |
| 0.900999999999956 | 1 | 0.434 |  |
| 0.901499999999956 | 1 | 0.433 |  |
| 0.901999999999956 | 1 | 0.432 |  |
| 0.902499999999956 | 1 | 0.431 |  |
| 0.902999999999956 | 1 | 0.43 |  |
| 0.903499999999956 | 1 | 0.429 |  |
| 0.903999999999956 | 1 | 0.428 |  |
| 0.904499999999956 | 1 | 0.426 |  |
| 0.904999999999956 | 1 | 0.425 |  |
| 0.905499999999956 | 1 | 0.424 |  |
| 0.905999999999956 | 1 | 0.423 |  |
| 0.906499999999956 | 1 | 0.422 |  |
| 0.906999999999955 | 1 | 0.421 |  |
| 0.907499999999955 | 1 | 0.42 |  |
| 0.907999999999955 | 1 | 0.419 |  |
| 0.908499999999955 | 1 | 0.418 |  |
| 0.908999999999955 | 1 | 0.417 |  |
| 0.909499999999955 | 1 | 0.416 |  |
| 0.909999999999955 | 1 | 0.415 |  |
| 0.910499999999955 | 1 | 0.414 |  |
| 0.910999999999955 | 1 | 0.412 |  |
| 0.911499999999955 | 1 | 0.411 |  |
| 0.911999999999955 | 1 | 0.41 |  |
| 0.912499999999955 | 1 | 0.409 |  |
| 0.912999999999955 | 1 | 0.408 |  |
| 0.913499999999955 | 1 | 0.407 |  |
| 0.913999999999955 | 1 | 0.406 |  |
| 0.914499999999955 | 1 | 0.405 |  |
| 0.914999999999955 | 1 | 0.403 |  |
| 0.915499999999955 | 1 | 0.402 |  |
| 0.915999999999954 | 1 | 0.401 |  |
| 0.916499999999954 | 1 | 0.4 |  |
| 0.916999999999954 | 1 | 0.399 |  |
| 0.917499999999954 | 1 | 0.398 |  |
| 0.917999999999954 | 1 | 0.397 |  |
| 0.918499999999954 | 1 | 0.395 |  |
| 0.918999999999954 | 1 | 0.394 |  |
| 0.919499999999954 | 1 | 0.393 |  |
| 0.919999999999954 | 1 | 0.392 |  |
| 0.920499999999954 | 1 | 0.391 |  |
| 0.920999999999954 | 1 | 0.39 |  |
| 0.921499999999954 | 1 | 0.388 |  |
| 0.921999999999954 | 1 | 0.387 |  |
| 0.922499999999954 | 1 | 0.386 |  |
| 0.922999999999954 | 1 | 0.385 |  |
| 0.923499999999954 | 1 | 0.384 |  |
| 0.923999999999954 | 1 | 0.382 |  |
| 0.924499999999954 | 1 | 0.381 |  |
| 0.924999999999953 | 1 | 0.38 |  |
| 0.925499999999953 | 1 | 0.379 |  |
| 0.925999999999953 | 1 | 0.378 |  |
| 0.926499999999953 | 1 | 0.376 |  |
| 0.926999999999953 | 1 | 0.375 |  |
| 0.927499999999953 | 1 | 0.374 |  |
| 0.927999999999953 | 1 | 0.373 |  |
| 0.928499999999953 | 1 | 0.371 |  |
| 0.928999999999953 | 1 | 0.37 |  |
| 0.929499999999953 | 1 | 0.369 |  |
| 0.929999999999953 | 1 | 0.368 |  |
| 0.930499999999953 | 1 | 0.366 |  |
| 0.930999999999953 | 1 | 0.365 |  |
| 0.931499999999953 | 1 | 0.364 |  |
| 0.931999999999953 | 1 | 0.362 |  |
| 0.932499999999953 | 1 | 0.361 |  |
| 0.932999999999953 | 1 | 0.36 |  |
| 0.933499999999953 | 1 | 0.359 |  |
| 0.933999999999953 | 1 | 0.357 |  |
| 0.934499999999952 | 1 | 0.356 |  |
| 0.934999999999952 | 1 | 0.355 |  |
| 0.935499999999952 | 1 | 0.353 |  |
| 0.935999999999952 | 1 | 0.352 |  |
| 0.936499999999952 | 1 | 0.351 |  |
| 0.936999999999952 | 1 | 0.349 |  |
| 0.937499999999952 | 1 | 0.348 |  |
| 0.937999999999952 | 1 | 0.347 |  |
| 0.938499999999952 | 1 | 0.345 |  |
| 0.938999999999952 | 1 | 0.344 |  |
| 0.939499999999952 | 1 | 0.343 |  |
| 0.939999999999952 | 1 | 0.341 |  |
| 0.940499999999952 | 1 | 0.34 |  |
| 0.940999999999952 | 1 | 0.338 |  |
| 0.941499999999952 | 1 | 0.337 |  |
| 0.941999999999952 | 1 | 0.336 |  |
| 0.942499999999952 | 1 | 0.334 |  |
| 0.942999999999952 | 1 | 0.333 |  |
| 0.943499999999951 | 1 | 0.331 |  |
| 0.943999999999951 | 1 | 0.33 |  |
| 0.944499999999951 | 1 | 0.329 |  |
| 0.944999999999951 | 1 | 0.327 |  |
| 0.945499999999951 | 1 | 0.326 |  |
| 0.945999999999951 | 1 | 0.324 |  |
| 0.946499999999951 | 1 | 0.323 |  |
| 0.946999999999951 | 1 | 0.321 |  |
| 0.947499999999951 | 1 | 0.32 |  |
| 0.947999999999951 | 1 | 0.318 |  |
| 0.948499999999951 | 1 | 0.317 |  |
| 0.948999999999951 | 1 | 0.315 |  |
| 0.949499999999951 | 1 | 0.314 |  |
| 0.949999999999951 | 1 | 0.312 |  |
| 0.950499999999951 | 1 | 0.311 |  |
| 0.950999999999951 | 1 | 0.309 |  |
| 0.951499999999951 | 1 | 0.308 |  |
| 0.951999999999951 | 1 | 0.306 |  |
| 0.95249999999995 | 1 | 0.305 |  |
| 0.95299999999995 | 1 | 0.303 |  |
| 0.95349999999995 | 1 | 0.301 |  |
| 0.95399999999995 | 1 | 0.3 |  |
| 0.95449999999995 | 1 | 0.298 |  |
| 0.95499999999995 | 1 | 0.297 |  |
| 0.95549999999995 | 1 | 0.295 |  |
| 0.95599999999995 | 1 | 0.293 |  |
| 0.95649999999995 | 1 | 0.292 |  |
| 0.95699999999995 | 1 | 0.29 |  |
| 0.95749999999995 | 1 | 0.288 |  |
| 0.95799999999995 | 1 | 0.287 |  |
| 0.95849999999995 | 1 | 0.285 |  |
| 0.95899999999995 | 1 | 0.283 |  |
| 0.95949999999995 | 1 | 0.282 |  |
| 0.95999999999995 | 1 | 0.28 |  |
| 0.96049999999995 | 1 | 0.278 |  |
| 0.96099999999995 | 1 | 0.277 |  |
| 0.961499999999949 | 1 | 0.275 |  |
| 0.961999999999949 | 1 | 0.273 |  |
| 0.962499999999949 | 1 | 0.271 |  |
| 0.962999999999949 | 1 | 0.27 |  |
| 0.963499999999949 | 1 | 0.268 |  |
| 0.963999999999949 | 1 | 0.266 |  |
| 0.964499999999949 | 1 | 0.264 |  |
| 0.964999999999949 | 1 | 0.262 |  |
| 0.965499999999949 | 1 | 0.26 |  |
| 0.965999999999949 | 1 | 0.259 |  |
| 0.966499999999949 | 1 | 0.257 |  |
| 0.966999999999949 | 1 | 0.255 |  |
| 0.967499999999949 | 1 | 0.253 |  |
| 0.967999999999949 | 1 | 0.251 |  |
| 0.968499999999949 | 1 | 0.249 |  |
| 0.968999999999949 | 1 | 0.247 |  |
| 0.969499999999949 | 1 | 0.245 |  |
| 0.969999999999949 | 1 | 0.243 |  |
| 0.970499999999948 | 1 | 0.241 |  |
| 0.970999999999948 | 1 | 0.239 |  |
| 0.971499999999948 | 1 | 0.237 |  |
| 0.971999999999948 | 1 | 0.235 |  |
| 0.972499999999948 | 1 | 0.233 |  |
| 0.972999999999948 | 1 | 0.231 |  |
| 0.973499999999948 | 1 | 0.229 |  |
| 0.973999999999948 | 1 | 0.227 |  |
| 0.974499999999948 | 1 | 0.224 |  |
| 0.974999999999948 | 1 | 0.222 |  |
| 0.975499999999948 | 1 | 0.22 |  |
| 0.975999999999948 | 1 | 0.218 |  |
| 0.976499999999948 | 1 | 0.216 |  |
| 0.976999999999948 | 1 | 0.213 |  |
| 0.977499999999948 | 1 | 0.211 |  |
| 0.977999999999948 | 1 | 0.209 |  |
| 0.978499999999948 | 1 | 0.206 |  |
| 0.978999999999948 | 1 | 0.204 |  |
| 0.979499999999947 | 1 | 0.201 |  |
| 0.979999999999947 | 1 | 0.199 |  |
| 0.980499999999947 | 1 | 0.197 |  |
| 0.980999999999947 | 1 | 0.194 |  |
| 0.981499999999947 | 1 | 0.191 |  |
| 0.981999999999947 | 1 | 0.189 |  |
| 0.982499999999947 | 1 | 0.186 |  |
| 0.982999999999947 | 1 | 0.184 |  |
| 0.983499999999947 | 1 | 0.181 |  |
| 0.983999999999947 | 1 | 0.178 |  |
| 0.984499999999947 | 1 | 0.175 |  |
| 0.984999999999947 | 1 | 0.173 |  |
| 0.985499999999947 | 1 | 0.17 |  |
| 0.985999999999947 | 1 | 0.167 |  |
| 0.986499999999947 | 1 | 0.164 |  |
| 0.986999999999947 | 1 | 0.161 |  |
| 0.987499999999947 | 1 | 0.158 |  |
| 0.987999999999947 | 1 | 0.154 |  |
| 0.988499999999946 | 1 | 0.151 |  |
| 0.988999999999946 | 1 | 0.148 |  |
| 0.989499999999946 | 1 | 0.145 |  |
| 0.989999999999946 | 1 | 0.141 |  |
| 0.990499999999946 | 1 | 0.138 |  |
| 0.990999999999946 | 1 | 0.134 |  |
| 0.991499999999946 | 1 | 0.13 |  |
| 0.991999999999946 | 1 | 0.126 |  |
| 0.992499999999946 | 1 | 0.122 |  |
| 0.992999999999946 | 1 | 0.118 |  |
| 0.993499999999946 | 1 | 0.114 |  |
| 0.993999999999946 | 1 | 0.109 |  |
| 0.994499999999946 | 1 | 0.105 |  |
| 0.994999999999946 | 1 | 0.1 |  |
| 0.995499999999946 | 1 | 0.095 |  |
| 0.995999999999946 | 1 | 0.089 |  |
| 0.996499999999946 | 1 | 0.084 |  |
| 0.996999999999946 | 1 | 0.077 |  |
| 0.997499999999945 | 1 | 0.071 |  |
| 0.997999999999945 | 1 | 0.063 |  |
| 0.998499999999945 | 1 | 0.055 |  |
| 0.998999999999945 | 1 | 0.045 |  |
| 0.999499999999945 | 1 | 0.032 |  |
| 0.999999999999945 | 1 | 0 |  |